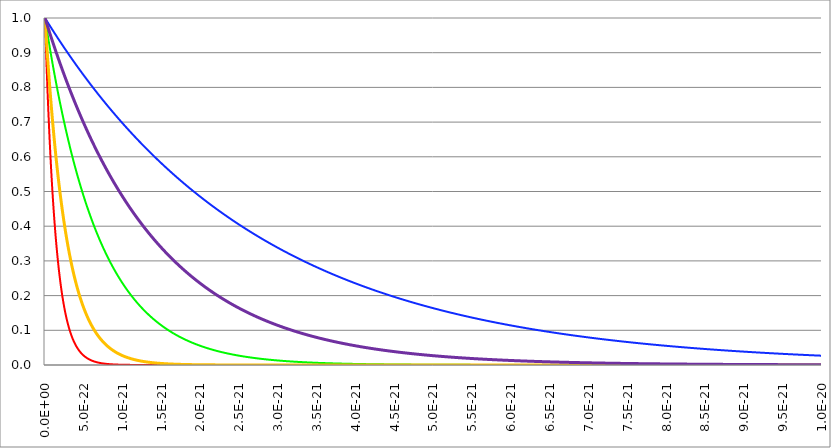
| Category | Series 1 | Series 0 | Series 2 | Series 3 | Series 4 |
|---|---|---|---|---|---|
| 0.0 | 1 | 1 | 1 | 1 | 1 |
| 5e-24 | 0.964 | 0.993 | 0.998 | 0.982 | 0.996 |
| 1e-23 | 0.93 | 0.986 | 0.996 | 0.964 | 0.993 |
| 1.5e-23 | 0.897 | 0.979 | 0.995 | 0.947 | 0.989 |
| 2e-23 | 0.865 | 0.971 | 0.993 | 0.93 | 0.986 |
| 2.5e-23 | 0.834 | 0.964 | 0.991 | 0.913 | 0.982 |
| 3e-23 | 0.805 | 0.957 | 0.989 | 0.897 | 0.979 |
| 3.5e-23 | 0.776 | 0.951 | 0.987 | 0.881 | 0.975 |
| 4e-23 | 0.748 | 0.944 | 0.986 | 0.865 | 0.971 |
| 4.5e-23 | 0.722 | 0.937 | 0.984 | 0.85 | 0.968 |
| 5e-23 | 0.696 | 0.93 | 0.982 | 0.834 | 0.964 |
| 5.5e-23 | 0.671 | 0.923 | 0.98 | 0.819 | 0.961 |
| 6e-23 | 0.648 | 0.917 | 0.979 | 0.805 | 0.957 |
| 6.5e-23 | 0.625 | 0.91 | 0.977 | 0.79 | 0.954 |
| 7e-23 | 0.602 | 0.904 | 0.975 | 0.776 | 0.951 |
| 7.5e-23 | 0.581 | 0.897 | 0.973 | 0.762 | 0.947 |
| 8e-23 | 0.56 | 0.891 | 0.971 | 0.748 | 0.944 |
| 8.5e-23 | 0.54 | 0.884 | 0.97 | 0.735 | 0.94 |
| 9e-23 | 0.521 | 0.878 | 0.968 | 0.722 | 0.937 |
| 9.5e-23 | 0.503 | 0.871 | 0.966 | 0.709 | 0.934 |
| 1e-22 | 0.485 | 0.865 | 0.964 | 0.696 | 0.93 |
| 1.05e-22 | 0.467 | 0.859 | 0.963 | 0.684 | 0.927 |
| 1.1e-22 | 0.451 | 0.853 | 0.961 | 0.671 | 0.923 |
| 1.15e-22 | 0.435 | 0.847 | 0.959 | 0.659 | 0.92 |
| 1.2e-22 | 0.419 | 0.84 | 0.957 | 0.648 | 0.917 |
| 1.25e-22 | 0.404 | 0.834 | 0.956 | 0.636 | 0.913 |
| 1.3e-22 | 0.39 | 0.828 | 0.954 | 0.625 | 0.91 |
| 1.35e-22 | 0.376 | 0.822 | 0.952 | 0.613 | 0.907 |
| 1.4e-22 | 0.363 | 0.816 | 0.951 | 0.602 | 0.904 |
| 1.45e-22 | 0.35 | 0.811 | 0.949 | 0.591 | 0.9 |
| 1.5e-22 | 0.337 | 0.805 | 0.947 | 0.581 | 0.897 |
| 1.55e-22 | 0.325 | 0.799 | 0.945 | 0.57 | 0.894 |
| 1.6e-22 | 0.314 | 0.793 | 0.944 | 0.56 | 0.891 |
| 1.65e-22 | 0.303 | 0.787 | 0.942 | 0.55 | 0.887 |
| 1.7e-22 | 0.292 | 0.782 | 0.94 | 0.54 | 0.884 |
| 1.75e-22 | 0.282 | 0.776 | 0.939 | 0.531 | 0.881 |
| 1.8e-22 | 0.272 | 0.77 | 0.937 | 0.521 | 0.878 |
| 1.85e-22 | 0.262 | 0.765 | 0.935 | 0.512 | 0.875 |
| 1.9e-22 | 0.253 | 0.759 | 0.934 | 0.503 | 0.871 |
| 1.95e-22 | 0.244 | 0.754 | 0.932 | 0.494 | 0.868 |
| 2e-22 | 0.235 | 0.748 | 0.93 | 0.485 | 0.865 |
| 2.05e-22 | 0.227 | 0.743 | 0.928 | 0.476 | 0.862 |
| 2.1e-22 | 0.218 | 0.738 | 0.927 | 0.467 | 0.859 |
| 2.15e-22 | 0.211 | 0.732 | 0.925 | 0.459 | 0.856 |
| 2.2e-22 | 0.203 | 0.727 | 0.923 | 0.451 | 0.853 |
| 2.25e-22 | 0.196 | 0.722 | 0.922 | 0.443 | 0.85 |
| 2.3e-22 | 0.189 | 0.717 | 0.92 | 0.435 | 0.847 |
| 2.35e-22 | 0.182 | 0.711 | 0.918 | 0.427 | 0.843 |
| 2.4e-22 | 0.176 | 0.706 | 0.917 | 0.419 | 0.84 |
| 2.45e-22 | 0.17 | 0.701 | 0.915 | 0.412 | 0.837 |
| 2.5e-22 | 0.164 | 0.696 | 0.913 | 0.404 | 0.834 |
| 2.55e-22 | 0.158 | 0.691 | 0.912 | 0.397 | 0.831 |
| 2.6e-22 | 0.152 | 0.686 | 0.91 | 0.39 | 0.828 |
| 2.65e-22 | 0.147 | 0.681 | 0.908 | 0.383 | 0.825 |
| 2.7e-22 | 0.141 | 0.676 | 0.907 | 0.376 | 0.822 |
| 2.75e-22 | 0.136 | 0.671 | 0.905 | 0.369 | 0.819 |
| 2.8e-22 | 0.132 | 0.667 | 0.904 | 0.363 | 0.816 |
| 2.85e-22 | 0.127 | 0.662 | 0.902 | 0.356 | 0.813 |
| 2.9e-22 | 0.122 | 0.657 | 0.9 | 0.35 | 0.811 |
| 2.95e-22 | 0.118 | 0.652 | 0.899 | 0.344 | 0.808 |
| 3e-22 | 0.114 | 0.648 | 0.897 | 0.337 | 0.805 |
| 3.05e-22 | 0.11 | 0.643 | 0.895 | 0.331 | 0.802 |
| 3.1e-22 | 0.106 | 0.638 | 0.894 | 0.325 | 0.799 |
| 3.15e-22 | 0.102 | 0.634 | 0.892 | 0.32 | 0.796 |
| 3.2e-22 | 0.098 | 0.629 | 0.891 | 0.314 | 0.793 |
| 3.25e-22 | 0.095 | 0.625 | 0.889 | 0.308 | 0.79 |
| 3.3e-22 | 0.092 | 0.62 | 0.887 | 0.303 | 0.787 |
| 3.35e-22 | 0.088 | 0.616 | 0.886 | 0.297 | 0.785 |
| 3.4e-22 | 0.085 | 0.611 | 0.884 | 0.292 | 0.782 |
| 3.45e-22 | 0.082 | 0.607 | 0.883 | 0.287 | 0.779 |
| 3.5e-22 | 0.079 | 0.602 | 0.881 | 0.282 | 0.776 |
| 3.55e-22 | 0.076 | 0.598 | 0.879 | 0.276 | 0.773 |
| 3.6e-22 | 0.074 | 0.594 | 0.878 | 0.272 | 0.77 |
| 3.65e-22 | 0.071 | 0.589 | 0.876 | 0.267 | 0.768 |
| 3.7e-22 | 0.069 | 0.585 | 0.875 | 0.262 | 0.765 |
| 3.75e-22 | 0.066 | 0.581 | 0.873 | 0.257 | 0.762 |
| 3.8e-22 | 0.064 | 0.577 | 0.871 | 0.253 | 0.759 |
| 3.85e-22 | 0.062 | 0.573 | 0.87 | 0.248 | 0.757 |
| 3.9e-22 | 0.059 | 0.568 | 0.868 | 0.244 | 0.754 |
| 3.95e-22 | 0.057 | 0.564 | 0.867 | 0.239 | 0.751 |
| 4e-22 | 0.055 | 0.56 | 0.865 | 0.235 | 0.748 |
| 4.05e-22 | 0.053 | 0.556 | 0.864 | 0.231 | 0.746 |
| 4.1e-22 | 0.051 | 0.552 | 0.862 | 0.227 | 0.743 |
| 4.15e-22 | 0.049 | 0.548 | 0.86 | 0.222 | 0.74 |
| 4.2e-22 | 0.048 | 0.544 | 0.859 | 0.218 | 0.738 |
| 4.25e-22 | 0.046 | 0.54 | 0.857 | 0.215 | 0.735 |
| 4.3e-22 | 0.044 | 0.536 | 0.856 | 0.211 | 0.732 |
| 4.35e-22 | 0.043 | 0.533 | 0.854 | 0.207 | 0.73 |
| 4.4e-22 | 0.041 | 0.529 | 0.853 | 0.203 | 0.727 |
| 4.45e-22 | 0.04 | 0.525 | 0.851 | 0.2 | 0.724 |
| 4.5e-22 | 0.038 | 0.521 | 0.85 | 0.196 | 0.722 |
| 4.55e-22 | 0.037 | 0.517 | 0.848 | 0.192 | 0.719 |
| 4.6e-22 | 0.036 | 0.514 | 0.847 | 0.189 | 0.717 |
| 4.65e-22 | 0.034 | 0.51 | 0.845 | 0.186 | 0.714 |
| 4.7e-22 | 0.033 | 0.506 | 0.843 | 0.182 | 0.711 |
| 4.75e-22 | 0.032 | 0.503 | 0.842 | 0.179 | 0.709 |
| 4.8e-22 | 0.031 | 0.499 | 0.84 | 0.176 | 0.706 |
| 4.85e-22 | 0.03 | 0.495 | 0.839 | 0.173 | 0.704 |
| 4.9e-22 | 0.029 | 0.492 | 0.837 | 0.17 | 0.701 |
| 4.95e-22 | 0.028 | 0.488 | 0.836 | 0.167 | 0.699 |
| 5e-22 | 0.027 | 0.485 | 0.834 | 0.164 | 0.696 |
| 5.05e-22 | 0.026 | 0.481 | 0.833 | 0.161 | 0.694 |
| 5.1e-22 | 0.025 | 0.478 | 0.831 | 0.158 | 0.691 |
| 5.15e-22 | 0.024 | 0.474 | 0.83 | 0.155 | 0.689 |
| 5.2e-22 | 0.023 | 0.471 | 0.828 | 0.152 | 0.686 |
| 5.25e-22 | 0.022 | 0.467 | 0.827 | 0.149 | 0.684 |
| 5.3e-22 | 0.022 | 0.464 | 0.825 | 0.147 | 0.681 |
| 5.35e-22 | 0.021 | 0.461 | 0.824 | 0.144 | 0.679 |
| 5.4e-22 | 0.02 | 0.457 | 0.822 | 0.141 | 0.676 |
| 5.45000000000001e-22 | 0.019 | 0.454 | 0.821 | 0.139 | 0.674 |
| 5.50000000000001e-22 | 0.019 | 0.451 | 0.819 | 0.136 | 0.671 |
| 5.55000000000001e-22 | 0.018 | 0.448 | 0.818 | 0.134 | 0.669 |
| 5.60000000000001e-22 | 0.017 | 0.444 | 0.816 | 0.132 | 0.667 |
| 5.65000000000001e-22 | 0.017 | 0.441 | 0.815 | 0.129 | 0.664 |
| 5.70000000000001e-22 | 0.016 | 0.438 | 0.813 | 0.127 | 0.662 |
| 5.75000000000001e-22 | 0.016 | 0.435 | 0.812 | 0.125 | 0.659 |
| 5.80000000000001e-22 | 0.015 | 0.432 | 0.811 | 0.122 | 0.657 |
| 5.85000000000001e-22 | 0.014 | 0.429 | 0.809 | 0.12 | 0.655 |
| 5.90000000000001e-22 | 0.014 | 0.425 | 0.808 | 0.118 | 0.652 |
| 5.95000000000001e-22 | 0.013 | 0.422 | 0.806 | 0.116 | 0.65 |
| 6.00000000000001e-22 | 0.013 | 0.419 | 0.805 | 0.114 | 0.648 |
| 6.05000000000001e-22 | 0.013 | 0.416 | 0.803 | 0.112 | 0.645 |
| 6.10000000000001e-22 | 0.012 | 0.413 | 0.802 | 0.11 | 0.643 |
| 6.15000000000001e-22 | 0.012 | 0.41 | 0.8 | 0.108 | 0.641 |
| 6.20000000000001e-22 | 0.011 | 0.407 | 0.799 | 0.106 | 0.638 |
| 6.25000000000001e-22 | 0.011 | 0.404 | 0.797 | 0.104 | 0.636 |
| 6.30000000000001e-22 | 0.01 | 0.401 | 0.796 | 0.102 | 0.634 |
| 6.35000000000001e-22 | 0.01 | 0.399 | 0.795 | 0.1 | 0.631 |
| 6.40000000000001e-22 | 0.01 | 0.396 | 0.793 | 0.098 | 0.629 |
| 6.45000000000001e-22 | 0.009 | 0.393 | 0.792 | 0.097 | 0.627 |
| 6.50000000000001e-22 | 0.009 | 0.39 | 0.79 | 0.095 | 0.625 |
| 6.55000000000001e-22 | 0.009 | 0.387 | 0.789 | 0.093 | 0.622 |
| 6.60000000000001e-22 | 0.008 | 0.384 | 0.787 | 0.092 | 0.62 |
| 6.65000000000001e-22 | 0.008 | 0.382 | 0.786 | 0.09 | 0.618 |
| 6.70000000000001e-22 | 0.008 | 0.379 | 0.785 | 0.088 | 0.616 |
| 6.75000000000001e-22 | 0.008 | 0.376 | 0.783 | 0.087 | 0.613 |
| 6.80000000000001e-22 | 0.007 | 0.373 | 0.782 | 0.085 | 0.611 |
| 6.85000000000001e-22 | 0.007 | 0.371 | 0.78 | 0.084 | 0.609 |
| 6.90000000000002e-22 | 0.007 | 0.368 | 0.779 | 0.082 | 0.607 |
| 6.95000000000002e-22 | 0.007 | 0.365 | 0.777 | 0.081 | 0.604 |
| 7.00000000000002e-22 | 0.006 | 0.363 | 0.776 | 0.079 | 0.602 |
| 7.05000000000002e-22 | 0.006 | 0.36 | 0.775 | 0.078 | 0.6 |
| 7.10000000000002e-22 | 0.006 | 0.358 | 0.773 | 0.076 | 0.598 |
| 7.15000000000002e-22 | 0.006 | 0.355 | 0.772 | 0.075 | 0.596 |
| 7.20000000000002e-22 | 0.005 | 0.352 | 0.77 | 0.074 | 0.594 |
| 7.25000000000002e-22 | 0.005 | 0.35 | 0.769 | 0.072 | 0.591 |
| 7.30000000000002e-22 | 0.005 | 0.347 | 0.768 | 0.071 | 0.589 |
| 7.35000000000002e-22 | 0.005 | 0.345 | 0.766 | 0.07 | 0.587 |
| 7.40000000000002e-22 | 0.005 | 0.342 | 0.765 | 0.069 | 0.585 |
| 7.45000000000002e-22 | 0.005 | 0.34 | 0.764 | 0.067 | 0.583 |
| 7.50000000000002e-22 | 0.004 | 0.337 | 0.762 | 0.066 | 0.581 |
| 7.55000000000002e-22 | 0.004 | 0.335 | 0.761 | 0.065 | 0.579 |
| 7.60000000000002e-22 | 0.004 | 0.333 | 0.759 | 0.064 | 0.577 |
| 7.65000000000002e-22 | 0.004 | 0.33 | 0.758 | 0.063 | 0.575 |
| 7.70000000000002e-22 | 0.004 | 0.328 | 0.757 | 0.062 | 0.573 |
| 7.75000000000002e-22 | 0.004 | 0.325 | 0.755 | 0.06 | 0.57 |
| 7.80000000000002e-22 | 0.004 | 0.323 | 0.754 | 0.059 | 0.568 |
| 7.85000000000002e-22 | 0.003 | 0.321 | 0.753 | 0.058 | 0.566 |
| 7.90000000000002e-22 | 0.003 | 0.318 | 0.751 | 0.057 | 0.564 |
| 7.95000000000002e-22 | 0.003 | 0.316 | 0.75 | 0.056 | 0.562 |
| 8.00000000000002e-22 | 0.003 | 0.314 | 0.748 | 0.055 | 0.56 |
| 8.05000000000002e-22 | 0.003 | 0.312 | 0.747 | 0.054 | 0.558 |
| 8.10000000000002e-22 | 0.003 | 0.309 | 0.746 | 0.053 | 0.556 |
| 8.15000000000002e-22 | 0.003 | 0.307 | 0.744 | 0.052 | 0.554 |
| 8.20000000000002e-22 | 0.003 | 0.305 | 0.743 | 0.051 | 0.552 |
| 8.25000000000002e-22 | 0.003 | 0.303 | 0.742 | 0.05 | 0.55 |
| 8.30000000000002e-22 | 0.002 | 0.3 | 0.74 | 0.049 | 0.548 |
| 8.35000000000002e-22 | 0.002 | 0.298 | 0.739 | 0.049 | 0.546 |
| 8.40000000000003e-22 | 0.002 | 0.296 | 0.738 | 0.048 | 0.544 |
| 8.45000000000003e-22 | 0.002 | 0.294 | 0.736 | 0.047 | 0.542 |
| 8.50000000000003e-22 | 0.002 | 0.292 | 0.735 | 0.046 | 0.54 |
| 8.55000000000003e-22 | 0.002 | 0.29 | 0.734 | 0.045 | 0.538 |
| 8.60000000000002e-22 | 0.002 | 0.288 | 0.732 | 0.044 | 0.536 |
| 8.65000000000002e-22 | 0.002 | 0.286 | 0.731 | 0.044 | 0.534 |
| 8.70000000000002e-22 | 0.002 | 0.284 | 0.73 | 0.043 | 0.533 |
| 8.75000000000002e-22 | 0.002 | 0.282 | 0.728 | 0.042 | 0.531 |
| 8.80000000000002e-22 | 0.002 | 0.279 | 0.727 | 0.041 | 0.529 |
| 8.85000000000002e-22 | 0.002 | 0.277 | 0.726 | 0.041 | 0.527 |
| 8.90000000000002e-22 | 0.002 | 0.275 | 0.724 | 0.04 | 0.525 |
| 8.95000000000002e-22 | 0.002 | 0.273 | 0.723 | 0.039 | 0.523 |
| 9.00000000000002e-22 | 0.001 | 0.272 | 0.722 | 0.038 | 0.521 |
| 9.05000000000002e-22 | 0.001 | 0.27 | 0.721 | 0.038 | 0.519 |
| 9.10000000000002e-22 | 0.001 | 0.268 | 0.719 | 0.037 | 0.517 |
| 9.15000000000002e-22 | 0.001 | 0.266 | 0.718 | 0.036 | 0.515 |
| 9.20000000000002e-22 | 0.001 | 0.264 | 0.717 | 0.036 | 0.514 |
| 9.25000000000002e-22 | 0.001 | 0.262 | 0.715 | 0.035 | 0.512 |
| 9.30000000000002e-22 | 0.001 | 0.26 | 0.714 | 0.034 | 0.51 |
| 9.35000000000002e-22 | 0.001 | 0.258 | 0.713 | 0.034 | 0.508 |
| 9.40000000000001e-22 | 0.001 | 0.256 | 0.711 | 0.033 | 0.506 |
| 9.45000000000002e-22 | 0.001 | 0.254 | 0.71 | 0.033 | 0.504 |
| 9.50000000000001e-22 | 0.001 | 0.253 | 0.709 | 0.032 | 0.503 |
| 9.55000000000001e-22 | 0.001 | 0.251 | 0.708 | 0.031 | 0.501 |
| 9.60000000000001e-22 | 0.001 | 0.249 | 0.706 | 0.031 | 0.499 |
| 9.65000000000001e-22 | 0.001 | 0.247 | 0.705 | 0.03 | 0.497 |
| 9.70000000000001e-22 | 0.001 | 0.245 | 0.704 | 0.03 | 0.495 |
| 9.75000000000001e-22 | 0.001 | 0.244 | 0.703 | 0.029 | 0.494 |
| 9.80000000000001e-22 | 0.001 | 0.242 | 0.701 | 0.029 | 0.492 |
| 9.85000000000001e-22 | 0.001 | 0.24 | 0.7 | 0.028 | 0.49 |
| 9.90000000000001e-22 | 0.001 | 0.238 | 0.699 | 0.028 | 0.488 |
| 9.95000000000001e-22 | 0.001 | 0.237 | 0.697 | 0.027 | 0.486 |
| 1e-21 | 0.001 | 0.235 | 0.696 | 0.027 | 0.485 |
| 1.005e-21 | 0.001 | 0.233 | 0.695 | 0.026 | 0.483 |
| 1.01e-21 | 0.001 | 0.232 | 0.694 | 0.026 | 0.481 |
| 1.015e-21 | 0.001 | 0.23 | 0.692 | 0.025 | 0.479 |
| 1.02e-21 | 0.001 | 0.228 | 0.691 | 0.025 | 0.478 |
| 1.025e-21 | 0.001 | 0.227 | 0.69 | 0.024 | 0.476 |
| 1.03e-21 | 0.001 | 0.225 | 0.689 | 0.024 | 0.474 |
| 1.035e-21 | 0.001 | 0.223 | 0.687 | 0.024 | 0.473 |
| 1.04e-21 | 0.001 | 0.222 | 0.686 | 0.023 | 0.471 |
| 1.045e-21 | 0.001 | 0.22 | 0.685 | 0.023 | 0.469 |
| 1.05e-21 | 0 | 0.218 | 0.684 | 0.022 | 0.467 |
| 1.055e-21 | 0 | 0.217 | 0.682 | 0.022 | 0.466 |
| 1.06e-21 | 0 | 0.215 | 0.681 | 0.022 | 0.464 |
| 1.065e-21 | 0 | 0.214 | 0.68 | 0.021 | 0.462 |
| 1.07e-21 | 0 | 0.212 | 0.679 | 0.021 | 0.461 |
| 1.075e-21 | 0 | 0.211 | 0.678 | 0.02 | 0.459 |
| 1.08e-21 | 0 | 0.209 | 0.676 | 0.02 | 0.457 |
| 1.085e-21 | 0 | 0.208 | 0.675 | 0.02 | 0.456 |
| 1.09e-21 | 0 | 0.206 | 0.674 | 0.019 | 0.454 |
| 1.095e-21 | 0 | 0.205 | 0.673 | 0.019 | 0.452 |
| 1.1e-21 | 0 | 0.203 | 0.671 | 0.019 | 0.451 |
| 1.105e-21 | 0 | 0.202 | 0.67 | 0.018 | 0.449 |
| 1.11e-21 | 0 | 0.2 | 0.669 | 0.018 | 0.448 |
| 1.115e-21 | 0 | 0.199 | 0.668 | 0.018 | 0.446 |
| 1.12e-21 | 0 | 0.197 | 0.667 | 0.017 | 0.444 |
| 1.125e-21 | 0 | 0.196 | 0.665 | 0.017 | 0.443 |
| 1.13e-21 | 0 | 0.195 | 0.664 | 0.017 | 0.441 |
| 1.135e-21 | 0 | 0.193 | 0.663 | 0.016 | 0.44 |
| 1.14e-21 | 0 | 0.192 | 0.662 | 0.016 | 0.438 |
| 1.145e-21 | 0 | 0.19 | 0.661 | 0.016 | 0.436 |
| 1.15e-21 | 0 | 0.189 | 0.659 | 0.016 | 0.435 |
| 1.155e-21 | 0 | 0.188 | 0.658 | 0.015 | 0.433 |
| 1.16e-21 | 0 | 0.186 | 0.657 | 0.015 | 0.432 |
| 1.165e-21 | 0 | 0.185 | 0.656 | 0.015 | 0.43 |
| 1.17e-21 | 0 | 0.184 | 0.655 | 0.014 | 0.429 |
| 1.175e-21 | 0 | 0.182 | 0.653 | 0.014 | 0.427 |
| 1.18e-21 | 0 | 0.181 | 0.652 | 0.014 | 0.425 |
| 1.185e-21 | 0 | 0.18 | 0.651 | 0.014 | 0.424 |
| 1.19e-21 | 0 | 0.178 | 0.65 | 0.013 | 0.422 |
| 1.195e-21 | 0 | 0.177 | 0.649 | 0.013 | 0.421 |
| 1.2e-21 | 0 | 0.176 | 0.648 | 0.013 | 0.419 |
| 1.205e-21 | 0 | 0.175 | 0.646 | 0.013 | 0.418 |
| 1.21e-21 | 0 | 0.173 | 0.645 | 0.013 | 0.416 |
| 1.215e-21 | 0 | 0.172 | 0.644 | 0.012 | 0.415 |
| 1.22e-21 | 0 | 0.171 | 0.643 | 0.012 | 0.413 |
| 1.225e-21 | 0 | 0.17 | 0.642 | 0.012 | 0.412 |
| 1.23e-21 | 0 | 0.168 | 0.641 | 0.012 | 0.41 |
| 1.235e-21 | 0 | 0.167 | 0.639 | 0.011 | 0.409 |
| 1.24e-21 | 0 | 0.166 | 0.638 | 0.011 | 0.407 |
| 1.245e-21 | 0 | 0.165 | 0.637 | 0.011 | 0.406 |
| 1.25e-21 | 0 | 0.164 | 0.636 | 0.011 | 0.404 |
| 1.255e-21 | 0 | 0.162 | 0.635 | 0.011 | 0.403 |
| 1.26e-21 | 0 | 0.161 | 0.634 | 0.01 | 0.401 |
| 1.265e-21 | 0 | 0.16 | 0.632 | 0.01 | 0.4 |
| 1.27e-21 | 0 | 0.159 | 0.631 | 0.01 | 0.399 |
| 1.275e-21 | 0 | 0.158 | 0.63 | 0.01 | 0.397 |
| 1.28e-21 | 0 | 0.157 | 0.629 | 0.01 | 0.396 |
| 1.285e-21 | 0 | 0.155 | 0.628 | 0.01 | 0.394 |
| 1.29e-21 | 0 | 0.154 | 0.627 | 0.009 | 0.393 |
| 1.295e-21 | 0 | 0.153 | 0.626 | 0.009 | 0.391 |
| 1.3e-21 | 0 | 0.152 | 0.625 | 0.009 | 0.39 |
| 1.305e-21 | 0 | 0.151 | 0.623 | 0.009 | 0.389 |
| 1.31e-21 | 0 | 0.15 | 0.622 | 0.009 | 0.387 |
| 1.315e-21 | 0 | 0.149 | 0.621 | 0.009 | 0.386 |
| 1.32e-21 | 0 | 0.148 | 0.62 | 0.008 | 0.384 |
| 1.325e-21 | 0 | 0.147 | 0.619 | 0.008 | 0.383 |
| 1.33e-21 | 0 | 0.146 | 0.618 | 0.008 | 0.382 |
| 1.335e-21 | 0 | 0.145 | 0.617 | 0.008 | 0.38 |
| 1.34e-21 | 0 | 0.144 | 0.616 | 0.008 | 0.379 |
| 1.345e-21 | 0 | 0.143 | 0.614 | 0.008 | 0.378 |
| 1.35e-21 | 0 | 0.141 | 0.613 | 0.008 | 0.376 |
| 1.355e-21 | 0 | 0.14 | 0.612 | 0.007 | 0.375 |
| 1.36e-21 | 0 | 0.139 | 0.611 | 0.007 | 0.373 |
| 1.365e-21 | 0 | 0.138 | 0.61 | 0.007 | 0.372 |
| 1.37e-21 | 0 | 0.137 | 0.609 | 0.007 | 0.371 |
| 1.375e-21 | 0 | 0.136 | 0.608 | 0.007 | 0.369 |
| 1.38e-21 | 0 | 0.135 | 0.607 | 0.007 | 0.368 |
| 1.385e-21 | 0 | 0.134 | 0.606 | 0.007 | 0.367 |
| 1.39e-21 | 0 | 0.134 | 0.604 | 0.007 | 0.365 |
| 1.395e-21 | 0 | 0.133 | 0.603 | 0.006 | 0.364 |
| 1.4e-21 | 0 | 0.132 | 0.602 | 0.006 | 0.363 |
| 1.405e-21 | 0 | 0.131 | 0.601 | 0.006 | 0.361 |
| 1.41e-21 | 0 | 0.13 | 0.6 | 0.006 | 0.36 |
| 1.415e-21 | 0 | 0.129 | 0.599 | 0.006 | 0.359 |
| 1.42e-21 | 0 | 0.128 | 0.598 | 0.006 | 0.358 |
| 1.425e-21 | 0 | 0.127 | 0.597 | 0.006 | 0.356 |
| 1.43e-21 | 0 | 0.126 | 0.596 | 0.006 | 0.355 |
| 1.435e-21 | 0 | 0.125 | 0.595 | 0.006 | 0.354 |
| 1.44e-21 | 0 | 0.124 | 0.594 | 0.005 | 0.352 |
| 1.445e-21 | 0 | 0.123 | 0.593 | 0.005 | 0.351 |
| 1.45e-21 | 0 | 0.122 | 0.591 | 0.005 | 0.35 |
| 1.455e-21 | 0 | 0.122 | 0.59 | 0.005 | 0.349 |
| 1.46e-21 | 0 | 0.121 | 0.589 | 0.005 | 0.347 |
| 1.465e-21 | 0 | 0.12 | 0.588 | 0.005 | 0.346 |
| 1.47e-21 | 0 | 0.119 | 0.587 | 0.005 | 0.345 |
| 1.47499999999999e-21 | 0 | 0.118 | 0.586 | 0.005 | 0.344 |
| 1.47999999999999e-21 | 0 | 0.117 | 0.585 | 0.005 | 0.342 |
| 1.48499999999999e-21 | 0 | 0.116 | 0.584 | 0.005 | 0.341 |
| 1.48999999999999e-21 | 0 | 0.116 | 0.583 | 0.005 | 0.34 |
| 1.49499999999999e-21 | 0 | 0.115 | 0.582 | 0.004 | 0.339 |
| 1.49999999999999e-21 | 0 | 0.114 | 0.581 | 0.004 | 0.337 |
| 1.50499999999999e-21 | 0 | 0.113 | 0.58 | 0.004 | 0.336 |
| 1.50999999999999e-21 | 0 | 0.112 | 0.579 | 0.004 | 0.335 |
| 1.51499999999999e-21 | 0 | 0.111 | 0.578 | 0.004 | 0.334 |
| 1.51999999999999e-21 | 0 | 0.111 | 0.577 | 0.004 | 0.333 |
| 1.52499999999999e-21 | 0 | 0.11 | 0.576 | 0.004 | 0.331 |
| 1.52999999999999e-21 | 0 | 0.109 | 0.575 | 0.004 | 0.33 |
| 1.53499999999999e-21 | 0 | 0.108 | 0.574 | 0.004 | 0.329 |
| 1.53999999999999e-21 | 0 | 0.107 | 0.573 | 0.004 | 0.328 |
| 1.54499999999999e-21 | 0 | 0.107 | 0.571 | 0.004 | 0.327 |
| 1.54999999999999e-21 | 0 | 0.106 | 0.57 | 0.004 | 0.325 |
| 1.55499999999999e-21 | 0 | 0.105 | 0.569 | 0.004 | 0.324 |
| 1.55999999999999e-21 | 0 | 0.104 | 0.568 | 0.004 | 0.323 |
| 1.56499999999999e-21 | 0 | 0.104 | 0.567 | 0.003 | 0.322 |
| 1.56999999999999e-21 | 0 | 0.103 | 0.566 | 0.003 | 0.321 |
| 1.57499999999999e-21 | 0 | 0.102 | 0.565 | 0.003 | 0.32 |
| 1.57999999999999e-21 | 0 | 0.101 | 0.564 | 0.003 | 0.318 |
| 1.58499999999999e-21 | 0 | 0.101 | 0.563 | 0.003 | 0.317 |
| 1.58999999999999e-21 | 0 | 0.1 | 0.562 | 0.003 | 0.316 |
| 1.59499999999999e-21 | 0 | 0.099 | 0.561 | 0.003 | 0.315 |
| 1.59999999999999e-21 | 0 | 0.098 | 0.56 | 0.003 | 0.314 |
| 1.60499999999999e-21 | 0 | 0.098 | 0.559 | 0.003 | 0.313 |
| 1.60999999999999e-21 | 0 | 0.097 | 0.558 | 0.003 | 0.312 |
| 1.61499999999999e-21 | 0 | 0.096 | 0.557 | 0.003 | 0.31 |
| 1.61999999999999e-21 | 0 | 0.096 | 0.556 | 0.003 | 0.309 |
| 1.62499999999999e-21 | 0 | 0.095 | 0.555 | 0.003 | 0.308 |
| 1.62999999999999e-21 | 0 | 0.094 | 0.554 | 0.003 | 0.307 |
| 1.63499999999999e-21 | 0 | 0.094 | 0.553 | 0.003 | 0.306 |
| 1.63999999999999e-21 | 0 | 0.093 | 0.552 | 0.003 | 0.305 |
| 1.64499999999999e-21 | 0 | 0.092 | 0.551 | 0.003 | 0.304 |
| 1.64999999999999e-21 | 0 | 0.092 | 0.55 | 0.003 | 0.303 |
| 1.65499999999999e-21 | 0 | 0.091 | 0.549 | 0.002 | 0.302 |
| 1.65999999999999e-21 | 0 | 0.09 | 0.548 | 0.002 | 0.3 |
| 1.66499999999999e-21 | 0 | 0.09 | 0.547 | 0.002 | 0.299 |
| 1.66999999999999e-21 | 0 | 0.089 | 0.546 | 0.002 | 0.298 |
| 1.67499999999999e-21 | 0 | 0.088 | 0.545 | 0.002 | 0.297 |
| 1.67999999999999e-21 | 0 | 0.088 | 0.544 | 0.002 | 0.296 |
| 1.68499999999999e-21 | 0 | 0.087 | 0.543 | 0.002 | 0.295 |
| 1.68999999999999e-21 | 0 | 0.086 | 0.542 | 0.002 | 0.294 |
| 1.69499999999999e-21 | 0 | 0.086 | 0.541 | 0.002 | 0.293 |
| 1.69999999999999e-21 | 0 | 0.085 | 0.54 | 0.002 | 0.292 |
| 1.70499999999999e-21 | 0 | 0.085 | 0.539 | 0.002 | 0.291 |
| 1.70999999999999e-21 | 0 | 0.084 | 0.538 | 0.002 | 0.29 |
| 1.71499999999999e-21 | 0 | 0.083 | 0.537 | 0.002 | 0.289 |
| 1.71999999999999e-21 | 0 | 0.083 | 0.536 | 0.002 | 0.288 |
| 1.72499999999999e-21 | 0 | 0.082 | 0.535 | 0.002 | 0.287 |
| 1.72999999999999e-21 | 0 | 0.082 | 0.534 | 0.002 | 0.286 |
| 1.73499999999999e-21 | 0 | 0.081 | 0.533 | 0.002 | 0.285 |
| 1.73999999999999e-21 | 0 | 0.08 | 0.533 | 0.002 | 0.284 |
| 1.74499999999999e-21 | 0 | 0.08 | 0.532 | 0.002 | 0.283 |
| 1.74999999999999e-21 | 0 | 0.079 | 0.531 | 0.002 | 0.282 |
| 1.75499999999999e-21 | 0 | 0.079 | 0.53 | 0.002 | 0.281 |
| 1.75999999999999e-21 | 0 | 0.078 | 0.529 | 0.002 | 0.279 |
| 1.76499999999999e-21 | 0 | 0.078 | 0.528 | 0.002 | 0.278 |
| 1.76999999999999e-21 | 0 | 0.077 | 0.527 | 0.002 | 0.277 |
| 1.77499999999999e-21 | 0 | 0.076 | 0.526 | 0.002 | 0.276 |
| 1.77999999999999e-21 | 0 | 0.076 | 0.525 | 0.002 | 0.275 |
| 1.78499999999999e-21 | 0 | 0.075 | 0.524 | 0.002 | 0.274 |
| 1.78999999999999e-21 | 0 | 0.075 | 0.523 | 0.002 | 0.273 |
| 1.79499999999999e-21 | 0 | 0.074 | 0.522 | 0.002 | 0.273 |
| 1.79999999999999e-21 | 0 | 0.074 | 0.521 | 0.001 | 0.272 |
| 1.80499999999999e-21 | 0 | 0.073 | 0.52 | 0.001 | 0.271 |
| 1.80999999999999e-21 | 0 | 0.073 | 0.519 | 0.001 | 0.27 |
| 1.81499999999999e-21 | 0 | 0.072 | 0.518 | 0.001 | 0.269 |
| 1.81999999999999e-21 | 0 | 0.072 | 0.517 | 0.001 | 0.268 |
| 1.82499999999999e-21 | 0 | 0.071 | 0.516 | 0.001 | 0.267 |
| 1.82999999999999e-21 | 0 | 0.071 | 0.515 | 0.001 | 0.266 |
| 1.83499999999999e-21 | 0 | 0.07 | 0.515 | 0.001 | 0.265 |
| 1.83999999999999e-21 | 0 | 0.07 | 0.514 | 0.001 | 0.264 |
| 1.84499999999999e-21 | 0 | 0.069 | 0.513 | 0.001 | 0.263 |
| 1.84999999999999e-21 | 0 | 0.069 | 0.512 | 0.001 | 0.262 |
| 1.85499999999999e-21 | 0 | 0.068 | 0.511 | 0.001 | 0.261 |
| 1.85999999999999e-21 | 0 | 0.068 | 0.51 | 0.001 | 0.26 |
| 1.86499999999999e-21 | 0 | 0.067 | 0.509 | 0.001 | 0.259 |
| 1.86999999999999e-21 | 0 | 0.067 | 0.508 | 0.001 | 0.258 |
| 1.87499999999999e-21 | 0 | 0.066 | 0.507 | 0.001 | 0.257 |
| 1.87999999999999e-21 | 0 | 0.066 | 0.506 | 0.001 | 0.256 |
| 1.88499999999999e-21 | 0 | 0.065 | 0.505 | 0.001 | 0.255 |
| 1.88999999999999e-21 | 0 | 0.065 | 0.504 | 0.001 | 0.254 |
| 1.89499999999999e-21 | 0 | 0.064 | 0.503 | 0.001 | 0.253 |
| 1.89999999999999e-21 | 0 | 0.064 | 0.503 | 0.001 | 0.253 |
| 1.90499999999999e-21 | 0 | 0.063 | 0.502 | 0.001 | 0.252 |
| 1.90999999999999e-21 | 0 | 0.063 | 0.501 | 0.001 | 0.251 |
| 1.91499999999999e-21 | 0 | 0.062 | 0.5 | 0.001 | 0.25 |
| 1.91999999999999e-21 | 0 | 0.062 | 0.499 | 0.001 | 0.249 |
| 1.92499999999999e-21 | 0 | 0.062 | 0.498 | 0.001 | 0.248 |
| 1.92999999999999e-21 | 0 | 0.061 | 0.497 | 0.001 | 0.247 |
| 1.93499999999999e-21 | 0 | 0.061 | 0.496 | 0.001 | 0.246 |
| 1.93999999999999e-21 | 0 | 0.06 | 0.495 | 0.001 | 0.245 |
| 1.94499999999999e-21 | 0 | 0.06 | 0.494 | 0.001 | 0.244 |
| 1.94999999999999e-21 | 0 | 0.059 | 0.494 | 0.001 | 0.244 |
| 1.95499999999999e-21 | 0 | 0.059 | 0.493 | 0.001 | 0.243 |
| 1.95999999999999e-21 | 0 | 0.058 | 0.492 | 0.001 | 0.242 |
| 1.96499999999999e-21 | 0 | 0.058 | 0.491 | 0.001 | 0.241 |
| 1.96999999999999e-21 | 0 | 0.058 | 0.49 | 0.001 | 0.24 |
| 1.97499999999999e-21 | 0 | 0.057 | 0.489 | 0.001 | 0.239 |
| 1.97999999999999e-21 | 0 | 0.057 | 0.488 | 0.001 | 0.238 |
| 1.98499999999999e-21 | 0 | 0.056 | 0.487 | 0.001 | 0.237 |
| 1.98999999999999e-21 | 0 | 0.056 | 0.486 | 0.001 | 0.237 |
| 1.99499999999999e-21 | 0 | 0.056 | 0.486 | 0.001 | 0.236 |
| 1.99999999999999e-21 | 0 | 0.055 | 0.485 | 0.001 | 0.235 |
| 2.00499999999999e-21 | 0 | 0.055 | 0.484 | 0.001 | 0.234 |
| 2.00999999999999e-21 | 0 | 0.054 | 0.483 | 0.001 | 0.233 |
| 2.01499999999999e-21 | 0 | 0.054 | 0.482 | 0.001 | 0.232 |
| 2.01999999999999e-21 | 0 | 0.054 | 0.481 | 0.001 | 0.232 |
| 2.02499999999999e-21 | 0 | 0.053 | 0.48 | 0.001 | 0.231 |
| 2.02999999999999e-21 | 0 | 0.053 | 0.479 | 0.001 | 0.23 |
| 2.03499999999999e-21 | 0 | 0.052 | 0.479 | 0.001 | 0.229 |
| 2.03999999999999e-21 | 0 | 0.052 | 0.478 | 0.001 | 0.228 |
| 2.04499999999999e-21 | 0 | 0.052 | 0.477 | 0.001 | 0.227 |
| 2.04999999999999e-21 | 0 | 0.051 | 0.476 | 0.001 | 0.227 |
| 2.05499999999999e-21 | 0 | 0.051 | 0.475 | 0.001 | 0.226 |
| 2.05999999999999e-21 | 0 | 0.051 | 0.474 | 0.001 | 0.225 |
| 2.06499999999999e-21 | 0 | 0.05 | 0.473 | 0.001 | 0.224 |
| 2.06999999999999e-21 | 0 | 0.05 | 0.473 | 0.001 | 0.223 |
| 2.07499999999999e-21 | 0 | 0.049 | 0.472 | 0.001 | 0.222 |
| 2.07999999999999e-21 | 0 | 0.049 | 0.471 | 0.001 | 0.222 |
| 2.08499999999999e-21 | 0 | 0.049 | 0.47 | 0.001 | 0.221 |
| 2.08999999999999e-21 | 0 | 0.048 | 0.469 | 0.001 | 0.22 |
| 2.09499999999999e-21 | 0 | 0.048 | 0.468 | 0.001 | 0.219 |
| 2.09999999999999e-21 | 0 | 0.048 | 0.467 | 0 | 0.218 |
| 2.10499999999999e-21 | 0 | 0.047 | 0.467 | 0 | 0.218 |
| 2.10999999999999e-21 | 0 | 0.047 | 0.466 | 0 | 0.217 |
| 2.11499999999999e-21 | 0 | 0.047 | 0.465 | 0 | 0.216 |
| 2.11999999999999e-21 | 0 | 0.046 | 0.464 | 0 | 0.215 |
| 2.12499999999999e-21 | 0 | 0.046 | 0.463 | 0 | 0.215 |
| 2.12999999999999e-21 | 0 | 0.046 | 0.462 | 0 | 0.214 |
| 2.13499999999999e-21 | 0 | 0.045 | 0.462 | 0 | 0.213 |
| 2.13999999999999e-21 | 0 | 0.045 | 0.461 | 0 | 0.212 |
| 2.14499999999999e-21 | 0 | 0.045 | 0.46 | 0 | 0.211 |
| 2.14999999999999e-21 | 0 | 0.044 | 0.459 | 0 | 0.211 |
| 2.15499999999999e-21 | 0 | 0.044 | 0.458 | 0 | 0.21 |
| 2.15999999999999e-21 | 0 | 0.044 | 0.457 | 0 | 0.209 |
| 2.16499999999999e-21 | 0 | 0.043 | 0.457 | 0 | 0.208 |
| 2.16999999999999e-21 | 0 | 0.043 | 0.456 | 0 | 0.208 |
| 2.17499999999999e-21 | 0 | 0.043 | 0.455 | 0 | 0.207 |
| 2.17999999999999e-21 | 0 | 0.043 | 0.454 | 0 | 0.206 |
| 2.18499999999999e-21 | 0 | 0.042 | 0.453 | 0 | 0.205 |
| 2.18999999999999e-21 | 0 | 0.042 | 0.452 | 0 | 0.205 |
| 2.19499999999999e-21 | 0 | 0.042 | 0.452 | 0 | 0.204 |
| 2.19999999999999e-21 | 0 | 0.041 | 0.451 | 0 | 0.203 |
| 2.20499999999999e-21 | 0 | 0.041 | 0.45 | 0 | 0.202 |
| 2.20999999999999e-21 | 0 | 0.041 | 0.449 | 0 | 0.202 |
| 2.21499999999999e-21 | 0 | 0.04 | 0.448 | 0 | 0.201 |
| 2.21999999999999e-21 | 0 | 0.04 | 0.448 | 0 | 0.2 |
| 2.22499999999999e-21 | 0 | 0.04 | 0.447 | 0 | 0.2 |
| 2.22999999999999e-21 | 0 | 0.04 | 0.446 | 0 | 0.199 |
| 2.23499999999999e-21 | 0 | 0.039 | 0.445 | 0 | 0.198 |
| 2.23999999999999e-21 | 0 | 0.039 | 0.444 | 0 | 0.197 |
| 2.24499999999999e-21 | 0 | 0.039 | 0.444 | 0 | 0.197 |
| 2.24999999999999e-21 | 0 | 0.038 | 0.443 | 0 | 0.196 |
| 2.25499999999999e-21 | 0 | 0.038 | 0.442 | 0 | 0.195 |
| 2.25999999999999e-21 | 0 | 0.038 | 0.441 | 0 | 0.195 |
| 2.26499999999999e-21 | 0 | 0.038 | 0.44 | 0 | 0.194 |
| 2.26999999999999e-21 | 0 | 0.037 | 0.44 | 0 | 0.193 |
| 2.27499999999999e-21 | 0 | 0.037 | 0.439 | 0 | 0.192 |
| 2.27999999999999e-21 | 0 | 0.037 | 0.438 | 0 | 0.192 |
| 2.28499999999999e-21 | 0 | 0.037 | 0.437 | 0 | 0.191 |
| 2.28999999999999e-21 | 0 | 0.036 | 0.436 | 0 | 0.19 |
| 2.29499999999999e-21 | 0 | 0.036 | 0.436 | 0 | 0.19 |
| 2.29999999999999e-21 | 0 | 0.036 | 0.435 | 0 | 0.189 |
| 2.30499999999999e-21 | 0 | 0.035 | 0.434 | 0 | 0.188 |
| 2.30999999999998e-21 | 0 | 0.035 | 0.433 | 0 | 0.188 |
| 2.31499999999998e-21 | 0 | 0.035 | 0.432 | 0 | 0.187 |
| 2.31999999999998e-21 | 0 | 0.035 | 0.432 | 0 | 0.186 |
| 2.32499999999998e-21 | 0 | 0.034 | 0.431 | 0 | 0.186 |
| 2.32999999999998e-21 | 0 | 0.034 | 0.43 | 0 | 0.185 |
| 2.33499999999998e-21 | 0 | 0.034 | 0.429 | 0 | 0.184 |
| 2.33999999999998e-21 | 0 | 0.034 | 0.429 | 0 | 0.184 |
| 2.34499999999998e-21 | 0 | 0.033 | 0.428 | 0 | 0.183 |
| 2.34999999999998e-21 | 0 | 0.033 | 0.427 | 0 | 0.182 |
| 2.35499999999998e-21 | 0 | 0.033 | 0.426 | 0 | 0.182 |
| 2.35999999999998e-21 | 0 | 0.033 | 0.425 | 0 | 0.181 |
| 2.36499999999998e-21 | 0 | 0.033 | 0.425 | 0 | 0.18 |
| 2.36999999999998e-21 | 0 | 0.032 | 0.424 | 0 | 0.18 |
| 2.37499999999998e-21 | 0 | 0.032 | 0.423 | 0 | 0.179 |
| 2.37999999999998e-21 | 0 | 0.032 | 0.422 | 0 | 0.178 |
| 2.38499999999998e-21 | 0 | 0.032 | 0.422 | 0 | 0.178 |
| 2.38999999999998e-21 | 0 | 0.031 | 0.421 | 0 | 0.177 |
| 2.39499999999998e-21 | 0 | 0.031 | 0.42 | 0 | 0.176 |
| 2.39999999999998e-21 | 0 | 0.031 | 0.419 | 0 | 0.176 |
| 2.40499999999998e-21 | 0 | 0.031 | 0.419 | 0 | 0.175 |
| 2.40999999999998e-21 | 0 | 0.03 | 0.418 | 0 | 0.175 |
| 2.41499999999998e-21 | 0 | 0.03 | 0.417 | 0 | 0.174 |
| 2.41999999999998e-21 | 0 | 0.03 | 0.416 | 0 | 0.173 |
| 2.42499999999998e-21 | 0 | 0.03 | 0.416 | 0 | 0.173 |
| 2.42999999999998e-21 | 0 | 0.03 | 0.415 | 0 | 0.172 |
| 2.43499999999998e-21 | 0 | 0.029 | 0.414 | 0 | 0.171 |
| 2.43999999999998e-21 | 0 | 0.029 | 0.413 | 0 | 0.171 |
| 2.44499999999998e-21 | 0 | 0.029 | 0.413 | 0 | 0.17 |
| 2.44999999999998e-21 | 0 | 0.029 | 0.412 | 0 | 0.17 |
| 2.45499999999998e-21 | 0 | 0.029 | 0.411 | 0 | 0.169 |
| 2.45999999999998e-21 | 0 | 0.028 | 0.41 | 0 | 0.168 |
| 2.46499999999998e-21 | 0 | 0.028 | 0.41 | 0 | 0.168 |
| 2.46999999999998e-21 | 0 | 0.028 | 0.409 | 0 | 0.167 |
| 2.47499999999998e-21 | 0 | 0.028 | 0.408 | 0 | 0.167 |
| 2.47999999999998e-21 | 0 | 0.028 | 0.407 | 0 | 0.166 |
| 2.48499999999998e-21 | 0 | 0.027 | 0.407 | 0 | 0.165 |
| 2.48999999999998e-21 | 0 | 0.027 | 0.406 | 0 | 0.165 |
| 2.49499999999998e-21 | 0 | 0.027 | 0.405 | 0 | 0.164 |
| 2.49999999999998e-21 | 0 | 0.027 | 0.404 | 0 | 0.164 |
| 2.50499999999998e-21 | 0 | 0.027 | 0.404 | 0 | 0.163 |
| 2.50999999999998e-21 | 0 | 0.026 | 0.403 | 0 | 0.162 |
| 2.51499999999998e-21 | 0 | 0.026 | 0.402 | 0 | 0.162 |
| 2.51999999999998e-21 | 0 | 0.026 | 0.401 | 0 | 0.161 |
| 2.52499999999998e-21 | 0 | 0.026 | 0.401 | 0 | 0.161 |
| 2.52999999999998e-21 | 0 | 0.026 | 0.4 | 0 | 0.16 |
| 2.53499999999998e-21 | 0 | 0.025 | 0.399 | 0 | 0.159 |
| 2.53999999999998e-21 | 0 | 0.025 | 0.399 | 0 | 0.159 |
| 2.54499999999998e-21 | 0 | 0.025 | 0.398 | 0 | 0.158 |
| 2.54999999999998e-21 | 0 | 0.025 | 0.397 | 0 | 0.158 |
| 2.55499999999998e-21 | 0 | 0.025 | 0.396 | 0 | 0.157 |
| 2.55999999999998e-21 | 0 | 0.025 | 0.396 | 0 | 0.157 |
| 2.56499999999998e-21 | 0 | 0.024 | 0.395 | 0 | 0.156 |
| 2.56999999999998e-21 | 0 | 0.024 | 0.394 | 0 | 0.155 |
| 2.57499999999998e-21 | 0 | 0.024 | 0.394 | 0 | 0.155 |
| 2.57999999999998e-21 | 0 | 0.024 | 0.393 | 0 | 0.154 |
| 2.58499999999998e-21 | 0 | 0.024 | 0.392 | 0 | 0.154 |
| 2.58999999999998e-21 | 0 | 0.023 | 0.391 | 0 | 0.153 |
| 2.59499999999998e-21 | 0 | 0.023 | 0.391 | 0 | 0.153 |
| 2.59999999999998e-21 | 0 | 0.023 | 0.39 | 0 | 0.152 |
| 2.60499999999998e-21 | 0 | 0.023 | 0.389 | 0 | 0.152 |
| 2.60999999999998e-21 | 0 | 0.023 | 0.389 | 0 | 0.151 |
| 2.61499999999998e-21 | 0 | 0.023 | 0.388 | 0 | 0.15 |
| 2.61999999999998e-21 | 0 | 0.022 | 0.387 | 0 | 0.15 |
| 2.62499999999998e-21 | 0 | 0.022 | 0.386 | 0 | 0.149 |
| 2.62999999999998e-21 | 0 | 0.022 | 0.386 | 0 | 0.149 |
| 2.63499999999998e-21 | 0 | 0.022 | 0.385 | 0 | 0.148 |
| 2.63999999999998e-21 | 0 | 0.022 | 0.384 | 0 | 0.148 |
| 2.64499999999998e-21 | 0 | 0.022 | 0.384 | 0 | 0.147 |
| 2.64999999999998e-21 | 0 | 0.022 | 0.383 | 0 | 0.147 |
| 2.65499999999998e-21 | 0 | 0.021 | 0.382 | 0 | 0.146 |
| 2.65999999999998e-21 | 0 | 0.021 | 0.382 | 0 | 0.146 |
| 2.66499999999998e-21 | 0 | 0.021 | 0.381 | 0 | 0.145 |
| 2.66999999999998e-21 | 0 | 0.021 | 0.38 | 0 | 0.145 |
| 2.67499999999998e-21 | 0 | 0.021 | 0.38 | 0 | 0.144 |
| 2.67999999999998e-21 | 0 | 0.021 | 0.379 | 0 | 0.144 |
| 2.68499999999998e-21 | 0 | 0.02 | 0.378 | 0 | 0.143 |
| 2.68999999999998e-21 | 0 | 0.02 | 0.378 | 0 | 0.143 |
| 2.69499999999998e-21 | 0 | 0.02 | 0.377 | 0 | 0.142 |
| 2.69999999999998e-21 | 0 | 0.02 | 0.376 | 0 | 0.141 |
| 2.70499999999998e-21 | 0 | 0.02 | 0.375 | 0 | 0.141 |
| 2.70999999999998e-21 | 0 | 0.02 | 0.375 | 0 | 0.14 |
| 2.71499999999998e-21 | 0 | 0.02 | 0.374 | 0 | 0.14 |
| 2.71999999999998e-21 | 0 | 0.019 | 0.373 | 0 | 0.139 |
| 2.72499999999998e-21 | 0 | 0.019 | 0.373 | 0 | 0.139 |
| 2.72999999999998e-21 | 0 | 0.019 | 0.372 | 0 | 0.138 |
| 2.73499999999998e-21 | 0 | 0.019 | 0.371 | 0 | 0.138 |
| 2.73999999999998e-21 | 0 | 0.019 | 0.371 | 0 | 0.137 |
| 2.74499999999998e-21 | 0 | 0.019 | 0.37 | 0 | 0.137 |
| 2.74999999999998e-21 | 0 | 0.019 | 0.369 | 0 | 0.136 |
| 2.75499999999998e-21 | 0 | 0.018 | 0.369 | 0 | 0.136 |
| 2.75999999999998e-21 | 0 | 0.018 | 0.368 | 0 | 0.135 |
| 2.76499999999998e-21 | 0 | 0.018 | 0.367 | 0 | 0.135 |
| 2.76999999999998e-21 | 0 | 0.018 | 0.367 | 0 | 0.134 |
| 2.77499999999998e-21 | 0 | 0.018 | 0.366 | 0 | 0.134 |
| 2.77999999999998e-21 | 0 | 0.018 | 0.365 | 0 | 0.134 |
| 2.78499999999998e-21 | 0 | 0.018 | 0.365 | 0 | 0.133 |
| 2.78999999999998e-21 | 0 | 0.018 | 0.364 | 0 | 0.133 |
| 2.79499999999998e-21 | 0 | 0.017 | 0.363 | 0 | 0.132 |
| 2.79999999999998e-21 | 0 | 0.017 | 0.363 | 0 | 0.132 |
| 2.80499999999998e-21 | 0 | 0.017 | 0.362 | 0 | 0.131 |
| 2.80999999999998e-21 | 0 | 0.017 | 0.361 | 0 | 0.131 |
| 2.81499999999998e-21 | 0 | 0.017 | 0.361 | 0 | 0.13 |
| 2.81999999999998e-21 | 0 | 0.017 | 0.36 | 0 | 0.13 |
| 2.82499999999998e-21 | 0 | 0.017 | 0.359 | 0 | 0.129 |
| 2.82999999999998e-21 | 0 | 0.017 | 0.359 | 0 | 0.129 |
| 2.83499999999998e-21 | 0 | 0.016 | 0.358 | 0 | 0.128 |
| 2.83999999999998e-21 | 0 | 0.016 | 0.358 | 0 | 0.128 |
| 2.84499999999998e-21 | 0 | 0.016 | 0.357 | 0 | 0.127 |
| 2.84999999999998e-21 | 0 | 0.016 | 0.356 | 0 | 0.127 |
| 2.85499999999998e-21 | 0 | 0.016 | 0.356 | 0 | 0.126 |
| 2.85999999999998e-21 | 0 | 0.016 | 0.355 | 0 | 0.126 |
| 2.86499999999998e-21 | 0 | 0.016 | 0.354 | 0 | 0.126 |
| 2.86999999999998e-21 | 0 | 0.016 | 0.354 | 0 | 0.125 |
| 2.87499999999998e-21 | 0 | 0.016 | 0.353 | 0 | 0.125 |
| 2.87999999999998e-21 | 0 | 0.015 | 0.352 | 0 | 0.124 |
| 2.88499999999998e-21 | 0 | 0.015 | 0.352 | 0 | 0.124 |
| 2.88999999999998e-21 | 0 | 0.015 | 0.351 | 0 | 0.123 |
| 2.89499999999998e-21 | 0 | 0.015 | 0.35 | 0 | 0.123 |
| 2.89999999999998e-21 | 0 | 0.015 | 0.35 | 0 | 0.122 |
| 2.90499999999998e-21 | 0 | 0.015 | 0.349 | 0 | 0.122 |
| 2.90999999999998e-21 | 0 | 0.015 | 0.349 | 0 | 0.122 |
| 2.91499999999998e-21 | 0 | 0.015 | 0.348 | 0 | 0.121 |
| 2.91999999999998e-21 | 0 | 0.015 | 0.347 | 0 | 0.121 |
| 2.92499999999998e-21 | 0 | 0.014 | 0.347 | 0 | 0.12 |
| 2.92999999999998e-21 | 0 | 0.014 | 0.346 | 0 | 0.12 |
| 2.93499999999998e-21 | 0 | 0.014 | 0.345 | 0 | 0.119 |
| 2.93999999999998e-21 | 0 | 0.014 | 0.345 | 0 | 0.119 |
| 2.94499999999998e-21 | 0 | 0.014 | 0.344 | 0 | 0.118 |
| 2.94999999999998e-21 | 0 | 0.014 | 0.344 | 0 | 0.118 |
| 2.95499999999998e-21 | 0 | 0.014 | 0.343 | 0 | 0.118 |
| 2.95999999999998e-21 | 0 | 0.014 | 0.342 | 0 | 0.117 |
| 2.96499999999998e-21 | 0 | 0.014 | 0.342 | 0 | 0.117 |
| 2.96999999999998e-21 | 0 | 0.014 | 0.341 | 0 | 0.116 |
| 2.97499999999998e-21 | 0 | 0.013 | 0.34 | 0 | 0.116 |
| 2.97999999999998e-21 | 0 | 0.013 | 0.34 | 0 | 0.116 |
| 2.98499999999998e-21 | 0 | 0.013 | 0.339 | 0 | 0.115 |
| 2.98999999999998e-21 | 0 | 0.013 | 0.339 | 0 | 0.115 |
| 2.99499999999998e-21 | 0 | 0.013 | 0.338 | 0 | 0.114 |
| 2.99999999999998e-21 | 0 | 0.013 | 0.337 | 0 | 0.114 |
| 3.00499999999998e-21 | 0 | 0.013 | 0.337 | 0 | 0.113 |
| 3.00999999999998e-21 | 0 | 0.013 | 0.336 | 0 | 0.113 |
| 3.01499999999998e-21 | 0 | 0.013 | 0.336 | 0 | 0.113 |
| 3.01999999999998e-21 | 0 | 0.013 | 0.335 | 0 | 0.112 |
| 3.02499999999998e-21 | 0 | 0.013 | 0.334 | 0 | 0.112 |
| 3.02999999999998e-21 | 0 | 0.012 | 0.334 | 0 | 0.111 |
| 3.03499999999998e-21 | 0 | 0.012 | 0.333 | 0 | 0.111 |
| 3.03999999999998e-21 | 0 | 0.012 | 0.333 | 0 | 0.111 |
| 3.04499999999998e-21 | 0 | 0.012 | 0.332 | 0 | 0.11 |
| 3.04999999999998e-21 | 0 | 0.012 | 0.331 | 0 | 0.11 |
| 3.05499999999998e-21 | 0 | 0.012 | 0.331 | 0 | 0.109 |
| 3.05999999999998e-21 | 0 | 0.012 | 0.33 | 0 | 0.109 |
| 3.06499999999998e-21 | 0 | 0.012 | 0.33 | 0 | 0.109 |
| 3.06999999999998e-21 | 0 | 0.012 | 0.329 | 0 | 0.108 |
| 3.07499999999998e-21 | 0 | 0.012 | 0.328 | 0 | 0.108 |
| 3.07999999999998e-21 | 0 | 0.012 | 0.328 | 0 | 0.107 |
| 3.08499999999998e-21 | 0 | 0.011 | 0.327 | 0 | 0.107 |
| 3.08999999999998e-21 | 0 | 0.011 | 0.327 | 0 | 0.107 |
| 3.09499999999998e-21 | 0 | 0.011 | 0.326 | 0 | 0.106 |
| 3.09999999999998e-21 | 0 | 0.011 | 0.325 | 0 | 0.106 |
| 3.10499999999998e-21 | 0 | 0.011 | 0.325 | 0 | 0.106 |
| 3.10999999999998e-21 | 0 | 0.011 | 0.324 | 0 | 0.105 |
| 3.11499999999998e-21 | 0 | 0.011 | 0.324 | 0 | 0.105 |
| 3.11999999999998e-21 | 0 | 0.011 | 0.323 | 0 | 0.104 |
| 3.12499999999998e-21 | 0 | 0.011 | 0.322 | 0 | 0.104 |
| 3.12999999999998e-21 | 0 | 0.011 | 0.322 | 0 | 0.104 |
| 3.13499999999997e-21 | 0 | 0.011 | 0.321 | 0 | 0.103 |
| 3.13999999999997e-21 | 0 | 0.011 | 0.321 | 0 | 0.103 |
| 3.14499999999998e-21 | 0 | 0.011 | 0.32 | 0 | 0.102 |
| 3.14999999999998e-21 | 0 | 0.01 | 0.32 | 0 | 0.102 |
| 3.15499999999997e-21 | 0 | 0.01 | 0.319 | 0 | 0.102 |
| 3.15999999999997e-21 | 0 | 0.01 | 0.318 | 0 | 0.101 |
| 3.16499999999997e-21 | 0 | 0.01 | 0.318 | 0 | 0.101 |
| 3.16999999999997e-21 | 0 | 0.01 | 0.317 | 0 | 0.101 |
| 3.17499999999997e-21 | 0 | 0.01 | 0.317 | 0 | 0.1 |
| 3.17999999999997e-21 | 0 | 0.01 | 0.316 | 0 | 0.1 |
| 3.18499999999997e-21 | 0 | 0.01 | 0.316 | 0 | 0.1 |
| 3.18999999999997e-21 | 0 | 0.01 | 0.315 | 0 | 0.099 |
| 3.19499999999997e-21 | 0 | 0.01 | 0.314 | 0 | 0.099 |
| 3.19999999999997e-21 | 0 | 0.01 | 0.314 | 0 | 0.098 |
| 3.20499999999997e-21 | 0 | 0.01 | 0.313 | 0 | 0.098 |
| 3.20999999999997e-21 | 0 | 0.01 | 0.313 | 0 | 0.098 |
| 3.21499999999997e-21 | 0 | 0.009 | 0.312 | 0 | 0.097 |
| 3.21999999999997e-21 | 0 | 0.009 | 0.312 | 0 | 0.097 |
| 3.22499999999997e-21 | 0 | 0.009 | 0.311 | 0 | 0.097 |
| 3.22999999999997e-21 | 0 | 0.009 | 0.31 | 0 | 0.096 |
| 3.23499999999997e-21 | 0 | 0.009 | 0.31 | 0 | 0.096 |
| 3.23999999999997e-21 | 0 | 0.009 | 0.309 | 0 | 0.096 |
| 3.24499999999997e-21 | 0 | 0.009 | 0.309 | 0 | 0.095 |
| 3.24999999999997e-21 | 0 | 0.009 | 0.308 | 0 | 0.095 |
| 3.25499999999997e-21 | 0 | 0.009 | 0.308 | 0 | 0.095 |
| 3.25999999999997e-21 | 0 | 0.009 | 0.307 | 0 | 0.094 |
| 3.26499999999997e-21 | 0 | 0.009 | 0.307 | 0 | 0.094 |
| 3.26999999999997e-21 | 0 | 0.009 | 0.306 | 0 | 0.094 |
| 3.27499999999997e-21 | 0 | 0.009 | 0.305 | 0 | 0.093 |
| 3.27999999999997e-21 | 0 | 0.009 | 0.305 | 0 | 0.093 |
| 3.28499999999997e-21 | 0 | 0.009 | 0.304 | 0 | 0.093 |
| 3.28999999999997e-21 | 0 | 0.009 | 0.304 | 0 | 0.092 |
| 3.29499999999997e-21 | 0 | 0.008 | 0.303 | 0 | 0.092 |
| 3.29999999999997e-21 | 0 | 0.008 | 0.303 | 0 | 0.092 |
| 3.30499999999997e-21 | 0 | 0.008 | 0.302 | 0 | 0.091 |
| 3.30999999999997e-21 | 0 | 0.008 | 0.302 | 0 | 0.091 |
| 3.31499999999997e-21 | 0 | 0.008 | 0.301 | 0 | 0.091 |
| 3.31999999999997e-21 | 0 | 0.008 | 0.3 | 0 | 0.09 |
| 3.32499999999997e-21 | 0 | 0.008 | 0.3 | 0 | 0.09 |
| 3.32999999999997e-21 | 0 | 0.008 | 0.299 | 0 | 0.09 |
| 3.33499999999997e-21 | 0 | 0.008 | 0.299 | 0 | 0.089 |
| 3.33999999999997e-21 | 0 | 0.008 | 0.298 | 0 | 0.089 |
| 3.34499999999997e-21 | 0 | 0.008 | 0.298 | 0 | 0.089 |
| 3.34999999999997e-21 | 0 | 0.008 | 0.297 | 0 | 0.088 |
| 3.35499999999997e-21 | 0 | 0.008 | 0.297 | 0 | 0.088 |
| 3.35999999999997e-21 | 0 | 0.008 | 0.296 | 0 | 0.088 |
| 3.36499999999997e-21 | 0 | 0.008 | 0.296 | 0 | 0.087 |
| 3.36999999999997e-21 | 0 | 0.008 | 0.295 | 0 | 0.087 |
| 3.37499999999997e-21 | 0 | 0.008 | 0.295 | 0 | 0.087 |
| 3.37999999999997e-21 | 0 | 0.007 | 0.294 | 0 | 0.086 |
| 3.38499999999997e-21 | 0 | 0.007 | 0.294 | 0 | 0.086 |
| 3.38999999999997e-21 | 0 | 0.007 | 0.293 | 0 | 0.086 |
| 3.39499999999997e-21 | 0 | 0.007 | 0.292 | 0 | 0.086 |
| 3.39999999999997e-21 | 0 | 0.007 | 0.292 | 0 | 0.085 |
| 3.40499999999997e-21 | 0 | 0.007 | 0.291 | 0 | 0.085 |
| 3.40999999999997e-21 | 0 | 0.007 | 0.291 | 0 | 0.085 |
| 3.41499999999997e-21 | 0 | 0.007 | 0.29 | 0 | 0.084 |
| 3.41999999999997e-21 | 0 | 0.007 | 0.29 | 0 | 0.084 |
| 3.42499999999997e-21 | 0 | 0.007 | 0.289 | 0 | 0.084 |
| 3.42999999999997e-21 | 0 | 0.007 | 0.289 | 0 | 0.083 |
| 3.43499999999997e-21 | 0 | 0.007 | 0.288 | 0 | 0.083 |
| 3.43999999999998e-21 | 0 | 0.007 | 0.288 | 0 | 0.083 |
| 3.44499999999998e-21 | 0 | 0.007 | 0.287 | 0 | 0.082 |
| 3.44999999999998e-21 | 0 | 0.007 | 0.287 | 0 | 0.082 |
| 3.45499999999998e-21 | 0 | 0.007 | 0.286 | 0 | 0.082 |
| 3.45999999999998e-21 | 0 | 0.007 | 0.286 | 0 | 0.082 |
| 3.46499999999998e-21 | 0 | 0.007 | 0.285 | 0 | 0.081 |
| 3.46999999999998e-21 | 0 | 0.007 | 0.285 | 0 | 0.081 |
| 3.47499999999998e-21 | 0 | 0.007 | 0.284 | 0 | 0.081 |
| 3.47999999999998e-21 | 0 | 0.006 | 0.284 | 0 | 0.08 |
| 3.48499999999998e-21 | 0 | 0.006 | 0.283 | 0 | 0.08 |
| 3.48999999999998e-21 | 0 | 0.006 | 0.283 | 0 | 0.08 |
| 3.49499999999998e-21 | 0 | 0.006 | 0.282 | 0 | 0.08 |
| 3.49999999999998e-21 | 0 | 0.006 | 0.282 | 0 | 0.079 |
| 3.50499999999998e-21 | 0 | 0.006 | 0.281 | 0 | 0.079 |
| 3.50999999999998e-21 | 0 | 0.006 | 0.281 | 0 | 0.079 |
| 3.51499999999998e-21 | 0 | 0.006 | 0.28 | 0 | 0.078 |
| 3.51999999999998e-21 | 0 | 0.006 | 0.279 | 0 | 0.078 |
| 3.52499999999998e-21 | 0 | 0.006 | 0.279 | 0 | 0.078 |
| 3.52999999999998e-21 | 0 | 0.006 | 0.278 | 0 | 0.078 |
| 3.53499999999998e-21 | 0 | 0.006 | 0.278 | 0 | 0.077 |
| 3.53999999999998e-21 | 0 | 0.006 | 0.277 | 0 | 0.077 |
| 3.54499999999998e-21 | 0 | 0.006 | 0.277 | 0 | 0.077 |
| 3.54999999999998e-21 | 0 | 0.006 | 0.276 | 0 | 0.076 |
| 3.55499999999998e-21 | 0 | 0.006 | 0.276 | 0 | 0.076 |
| 3.55999999999998e-21 | 0 | 0.006 | 0.275 | 0 | 0.076 |
| 3.56499999999998e-21 | 0 | 0.006 | 0.275 | 0 | 0.076 |
| 3.56999999999998e-21 | 0 | 0.006 | 0.274 | 0 | 0.075 |
| 3.57499999999998e-21 | 0 | 0.006 | 0.274 | 0 | 0.075 |
| 3.57999999999998e-21 | 0 | 0.006 | 0.273 | 0 | 0.075 |
| 3.58499999999998e-21 | 0 | 0.006 | 0.273 | 0 | 0.075 |
| 3.58999999999998e-21 | 0 | 0.006 | 0.273 | 0 | 0.074 |
| 3.59499999999999e-21 | 0 | 0.005 | 0.272 | 0 | 0.074 |
| 3.59999999999999e-21 | 0 | 0.005 | 0.272 | 0 | 0.074 |
| 3.60499999999999e-21 | 0 | 0.005 | 0.271 | 0 | 0.073 |
| 3.60999999999999e-21 | 0 | 0.005 | 0.271 | 0 | 0.073 |
| 3.61499999999999e-21 | 0 | 0.005 | 0.27 | 0 | 0.073 |
| 3.61999999999999e-21 | 0 | 0.005 | 0.27 | 0 | 0.073 |
| 3.62499999999999e-21 | 0 | 0.005 | 0.269 | 0 | 0.072 |
| 3.62999999999999e-21 | 0 | 0.005 | 0.269 | 0 | 0.072 |
| 3.63499999999999e-21 | 0 | 0.005 | 0.268 | 0 | 0.072 |
| 3.63999999999999e-21 | 0 | 0.005 | 0.268 | 0 | 0.072 |
| 3.64499999999999e-21 | 0 | 0.005 | 0.267 | 0 | 0.071 |
| 3.64999999999999e-21 | 0 | 0.005 | 0.267 | 0 | 0.071 |
| 3.65499999999999e-21 | 0 | 0.005 | 0.266 | 0 | 0.071 |
| 3.65999999999999e-21 | 0 | 0.005 | 0.266 | 0 | 0.071 |
| 3.66499999999999e-21 | 0 | 0.005 | 0.265 | 0 | 0.07 |
| 3.66999999999999e-21 | 0 | 0.005 | 0.265 | 0 | 0.07 |
| 3.67499999999999e-21 | 0 | 0.005 | 0.264 | 0 | 0.07 |
| 3.68e-21 | 0 | 0.005 | 0.264 | 0 | 0.07 |
| 3.685e-21 | 0 | 0.005 | 0.263 | 0 | 0.069 |
| 3.68999999999999e-21 | 0 | 0.005 | 0.263 | 0 | 0.069 |
| 3.69499999999999e-21 | 0 | 0.005 | 0.262 | 0 | 0.069 |
| 3.69999999999999e-21 | 0 | 0.005 | 0.262 | 0 | 0.069 |
| 3.70499999999999e-21 | 0 | 0.005 | 0.261 | 0 | 0.068 |
| 3.70999999999999e-21 | 0 | 0.005 | 0.261 | 0 | 0.068 |
| 3.71499999999999e-21 | 0 | 0.005 | 0.26 | 0 | 0.068 |
| 3.71999999999999e-21 | 0 | 0.005 | 0.26 | 0 | 0.068 |
| 3.72499999999999e-21 | 0 | 0.005 | 0.259 | 0 | 0.067 |
| 3.72999999999999e-21 | 0 | 0.005 | 0.259 | 0 | 0.067 |
| 3.73499999999999e-21 | 0 | 0.004 | 0.259 | 0 | 0.067 |
| 3.73999999999999e-21 | 0 | 0.004 | 0.258 | 0 | 0.067 |
| 3.74499999999999e-21 | 0 | 0.004 | 0.258 | 0 | 0.066 |
| 3.74999999999999e-21 | 0 | 0.004 | 0.257 | 0 | 0.066 |
| 3.75499999999999e-21 | 0 | 0.004 | 0.257 | 0 | 0.066 |
| 3.76e-21 | 0 | 0.004 | 0.256 | 0 | 0.066 |
| 3.765e-21 | 0 | 0.004 | 0.256 | 0 | 0.065 |
| 3.77e-21 | 0 | 0.004 | 0.255 | 0 | 0.065 |
| 3.775e-21 | 0 | 0.004 | 0.255 | 0 | 0.065 |
| 3.78e-21 | 0 | 0.004 | 0.254 | 0 | 0.065 |
| 3.785e-21 | 0 | 0.004 | 0.254 | 0 | 0.064 |
| 3.79e-21 | 0 | 0.004 | 0.253 | 0 | 0.064 |
| 3.795e-21 | 0 | 0.004 | 0.253 | 0 | 0.064 |
| 3.8e-21 | 0 | 0.004 | 0.253 | 0 | 0.064 |
| 3.805e-21 | 0 | 0.004 | 0.252 | 0 | 0.064 |
| 3.81e-21 | 0 | 0.004 | 0.252 | 0 | 0.063 |
| 3.815e-21 | 0 | 0.004 | 0.251 | 0 | 0.063 |
| 3.82e-21 | 0 | 0.004 | 0.251 | 0 | 0.063 |
| 3.825e-21 | 0 | 0.004 | 0.25 | 0 | 0.063 |
| 3.83e-21 | 0 | 0.004 | 0.25 | 0 | 0.062 |
| 3.835e-21 | 0 | 0.004 | 0.249 | 0 | 0.062 |
| 3.84e-21 | 0 | 0.004 | 0.249 | 0 | 0.062 |
| 3.845e-21 | 0 | 0.004 | 0.248 | 0 | 0.062 |
| 3.85e-21 | 0 | 0.004 | 0.248 | 0 | 0.062 |
| 3.855e-21 | 0 | 0.004 | 0.248 | 0 | 0.061 |
| 3.86e-21 | 0 | 0.004 | 0.247 | 0 | 0.061 |
| 3.865e-21 | 0 | 0.004 | 0.247 | 0 | 0.061 |
| 3.87e-21 | 0 | 0.004 | 0.246 | 0 | 0.061 |
| 3.875e-21 | 0 | 0.004 | 0.246 | 0 | 0.06 |
| 3.88e-21 | 0 | 0.004 | 0.245 | 0 | 0.06 |
| 3.885e-21 | 0 | 0.004 | 0.245 | 0 | 0.06 |
| 3.89e-21 | 0 | 0.004 | 0.244 | 0 | 0.06 |
| 3.895e-21 | 0 | 0.004 | 0.244 | 0 | 0.06 |
| 3.9e-21 | 0 | 0.004 | 0.244 | 0 | 0.059 |
| 3.905e-21 | 0 | 0.003 | 0.243 | 0 | 0.059 |
| 3.91000000000001e-21 | 0 | 0.003 | 0.243 | 0 | 0.059 |
| 3.91500000000001e-21 | 0 | 0.003 | 0.242 | 0 | 0.059 |
| 3.92000000000001e-21 | 0 | 0.003 | 0.242 | 0 | 0.058 |
| 3.92500000000001e-21 | 0 | 0.003 | 0.241 | 0 | 0.058 |
| 3.93000000000001e-21 | 0 | 0.003 | 0.241 | 0 | 0.058 |
| 3.93500000000001e-21 | 0 | 0.003 | 0.24 | 0 | 0.058 |
| 3.94000000000001e-21 | 0 | 0.003 | 0.24 | 0 | 0.058 |
| 3.94500000000001e-21 | 0 | 0.003 | 0.24 | 0 | 0.057 |
| 3.95000000000001e-21 | 0 | 0.003 | 0.239 | 0 | 0.057 |
| 3.95500000000001e-21 | 0 | 0.003 | 0.239 | 0 | 0.057 |
| 3.96000000000001e-21 | 0 | 0.003 | 0.238 | 0 | 0.057 |
| 3.96500000000001e-21 | 0 | 0.003 | 0.238 | 0 | 0.057 |
| 3.97000000000001e-21 | 0 | 0.003 | 0.237 | 0 | 0.056 |
| 3.97500000000001e-21 | 0 | 0.003 | 0.237 | 0 | 0.056 |
| 3.98000000000001e-21 | 0 | 0.003 | 0.237 | 0 | 0.056 |
| 3.98500000000001e-21 | 0 | 0.003 | 0.236 | 0 | 0.056 |
| 3.99000000000001e-21 | 0 | 0.003 | 0.236 | 0 | 0.056 |
| 3.99500000000001e-21 | 0 | 0.003 | 0.235 | 0 | 0.055 |
| 4.00000000000001e-21 | 0 | 0.003 | 0.235 | 0 | 0.055 |
| 4.00500000000001e-21 | 0 | 0.003 | 0.234 | 0 | 0.055 |
| 4.01000000000001e-21 | 0 | 0.003 | 0.234 | 0 | 0.055 |
| 4.01500000000001e-21 | 0 | 0.003 | 0.234 | 0 | 0.055 |
| 4.02000000000001e-21 | 0 | 0.003 | 0.233 | 0 | 0.054 |
| 4.02500000000001e-21 | 0 | 0.003 | 0.233 | 0 | 0.054 |
| 4.03000000000001e-21 | 0 | 0.003 | 0.232 | 0 | 0.054 |
| 4.03500000000001e-21 | 0 | 0.003 | 0.232 | 0 | 0.054 |
| 4.04000000000001e-21 | 0 | 0.003 | 0.232 | 0 | 0.054 |
| 4.04500000000001e-21 | 0 | 0.003 | 0.231 | 0 | 0.053 |
| 4.05000000000001e-21 | 0 | 0.003 | 0.231 | 0 | 0.053 |
| 4.05500000000001e-21 | 0 | 0.003 | 0.23 | 0 | 0.053 |
| 4.06000000000001e-21 | 0 | 0.003 | 0.23 | 0 | 0.053 |
| 4.06500000000001e-21 | 0 | 0.003 | 0.229 | 0 | 0.053 |
| 4.07000000000002e-21 | 0 | 0.003 | 0.229 | 0 | 0.052 |
| 4.07500000000002e-21 | 0 | 0.003 | 0.229 | 0 | 0.052 |
| 4.08000000000002e-21 | 0 | 0.003 | 0.228 | 0 | 0.052 |
| 4.08500000000002e-21 | 0 | 0.003 | 0.228 | 0 | 0.052 |
| 4.09000000000002e-21 | 0 | 0.003 | 0.227 | 0 | 0.052 |
| 4.09500000000002e-21 | 0 | 0.003 | 0.227 | 0 | 0.052 |
| 4.10000000000002e-21 | 0 | 0.003 | 0.227 | 0 | 0.051 |
| 4.10500000000002e-21 | 0 | 0.003 | 0.226 | 0 | 0.051 |
| 4.11000000000002e-21 | 0 | 0.003 | 0.226 | 0 | 0.051 |
| 4.11500000000002e-21 | 0 | 0.003 | 0.225 | 0 | 0.051 |
| 4.12000000000002e-21 | 0 | 0.003 | 0.225 | 0 | 0.051 |
| 4.12500000000002e-21 | 0 | 0.003 | 0.225 | 0 | 0.05 |
| 4.13000000000002e-21 | 0 | 0.003 | 0.224 | 0 | 0.05 |
| 4.13500000000002e-21 | 0 | 0.003 | 0.224 | 0 | 0.05 |
| 4.14000000000002e-21 | 0 | 0.002 | 0.223 | 0 | 0.05 |
| 4.14500000000002e-21 | 0 | 0.002 | 0.223 | 0 | 0.05 |
| 4.15000000000002e-21 | 0 | 0.002 | 0.222 | 0 | 0.049 |
| 4.15500000000002e-21 | 0 | 0.002 | 0.222 | 0 | 0.049 |
| 4.16000000000002e-21 | 0 | 0.002 | 0.222 | 0 | 0.049 |
| 4.16500000000002e-21 | 0 | 0.002 | 0.221 | 0 | 0.049 |
| 4.17000000000002e-21 | 0 | 0.002 | 0.221 | 0 | 0.049 |
| 4.17500000000002e-21 | 0 | 0.002 | 0.22 | 0 | 0.049 |
| 4.18000000000002e-21 | 0 | 0.002 | 0.22 | 0 | 0.048 |
| 4.18500000000002e-21 | 0 | 0.002 | 0.22 | 0 | 0.048 |
| 4.19000000000002e-21 | 0 | 0.002 | 0.219 | 0 | 0.048 |
| 4.19500000000002e-21 | 0 | 0.002 | 0.219 | 0 | 0.048 |
| 4.20000000000002e-21 | 0 | 0.002 | 0.218 | 0 | 0.048 |
| 4.20500000000002e-21 | 0 | 0.002 | 0.218 | 0 | 0.048 |
| 4.21000000000002e-21 | 0 | 0.002 | 0.218 | 0 | 0.047 |
| 4.21500000000002e-21 | 0 | 0.002 | 0.217 | 0 | 0.047 |
| 4.22000000000002e-21 | 0 | 0.002 | 0.217 | 0 | 0.047 |
| 4.22500000000002e-21 | 0 | 0.002 | 0.217 | 0 | 0.047 |
| 4.23000000000003e-21 | 0 | 0.002 | 0.216 | 0 | 0.047 |
| 4.23500000000003e-21 | 0 | 0.002 | 0.216 | 0 | 0.047 |
| 4.24000000000003e-21 | 0 | 0.002 | 0.215 | 0 | 0.046 |
| 4.24500000000003e-21 | 0 | 0.002 | 0.215 | 0 | 0.046 |
| 4.25000000000003e-21 | 0 | 0.002 | 0.215 | 0 | 0.046 |
| 4.25500000000003e-21 | 0 | 0.002 | 0.214 | 0 | 0.046 |
| 4.26000000000003e-21 | 0 | 0.002 | 0.214 | 0 | 0.046 |
| 4.26500000000003e-21 | 0 | 0.002 | 0.213 | 0 | 0.046 |
| 4.27000000000003e-21 | 0 | 0.002 | 0.213 | 0 | 0.045 |
| 4.27500000000003e-21 | 0 | 0.002 | 0.213 | 0 | 0.045 |
| 4.28000000000003e-21 | 0 | 0.002 | 0.212 | 0 | 0.045 |
| 4.28500000000003e-21 | 0 | 0.002 | 0.212 | 0 | 0.045 |
| 4.29000000000003e-21 | 0 | 0.002 | 0.211 | 0 | 0.045 |
| 4.29500000000003e-21 | 0 | 0.002 | 0.211 | 0 | 0.045 |
| 4.30000000000003e-21 | 0 | 0.002 | 0.211 | 0 | 0.044 |
| 4.30500000000003e-21 | 0 | 0.002 | 0.21 | 0 | 0.044 |
| 4.31000000000003e-21 | 0 | 0.002 | 0.21 | 0 | 0.044 |
| 4.31500000000003e-21 | 0 | 0.002 | 0.21 | 0 | 0.044 |
| 4.32000000000003e-21 | 0 | 0.002 | 0.209 | 0 | 0.044 |
| 4.32500000000003e-21 | 0 | 0.002 | 0.209 | 0 | 0.044 |
| 4.33000000000003e-21 | 0 | 0.002 | 0.208 | 0 | 0.043 |
| 4.33500000000003e-21 | 0 | 0.002 | 0.208 | 0 | 0.043 |
| 4.34000000000003e-21 | 0 | 0.002 | 0.208 | 0 | 0.043 |
| 4.34500000000003e-21 | 0 | 0.002 | 0.207 | 0 | 0.043 |
| 4.35000000000003e-21 | 0 | 0.002 | 0.207 | 0 | 0.043 |
| 4.35500000000003e-21 | 0 | 0.002 | 0.207 | 0 | 0.043 |
| 4.36000000000003e-21 | 0 | 0.002 | 0.206 | 0 | 0.043 |
| 4.36500000000003e-21 | 0 | 0.002 | 0.206 | 0 | 0.042 |
| 4.37000000000003e-21 | 0 | 0.002 | 0.205 | 0 | 0.042 |
| 4.37500000000003e-21 | 0 | 0.002 | 0.205 | 0 | 0.042 |
| 4.38000000000003e-21 | 0 | 0.002 | 0.205 | 0 | 0.042 |
| 4.38500000000003e-21 | 0 | 0.002 | 0.204 | 0 | 0.042 |
| 4.39000000000004e-21 | 0 | 0.002 | 0.204 | 0 | 0.042 |
| 4.39500000000004e-21 | 0 | 0.002 | 0.204 | 0 | 0.041 |
| 4.40000000000004e-21 | 0 | 0.002 | 0.203 | 0 | 0.041 |
| 4.40500000000004e-21 | 0 | 0.002 | 0.203 | 0 | 0.041 |
| 4.41000000000004e-21 | 0 | 0.002 | 0.202 | 0 | 0.041 |
| 4.41500000000004e-21 | 0 | 0.002 | 0.202 | 0 | 0.041 |
| 4.42000000000004e-21 | 0 | 0.002 | 0.202 | 0 | 0.041 |
| 4.42500000000004e-21 | 0 | 0.002 | 0.201 | 0 | 0.041 |
| 4.43000000000004e-21 | 0 | 0.002 | 0.201 | 0 | 0.04 |
| 4.43500000000004e-21 | 0 | 0.002 | 0.201 | 0 | 0.04 |
| 4.44000000000004e-21 | 0 | 0.002 | 0.2 | 0 | 0.04 |
| 4.44500000000004e-21 | 0 | 0.002 | 0.2 | 0 | 0.04 |
| 4.45000000000004e-21 | 0 | 0.002 | 0.2 | 0 | 0.04 |
| 4.45500000000004e-21 | 0 | 0.002 | 0.199 | 0 | 0.04 |
| 4.46000000000004e-21 | 0 | 0.002 | 0.199 | 0 | 0.04 |
| 4.46500000000004e-21 | 0 | 0.002 | 0.198 | 0 | 0.039 |
| 4.47000000000004e-21 | 0 | 0.002 | 0.198 | 0 | 0.039 |
| 4.47500000000004e-21 | 0 | 0.002 | 0.198 | 0 | 0.039 |
| 4.48000000000004e-21 | 0 | 0.002 | 0.197 | 0 | 0.039 |
| 4.48500000000004e-21 | 0 | 0.002 | 0.197 | 0 | 0.039 |
| 4.49000000000004e-21 | 0 | 0.001 | 0.197 | 0 | 0.039 |
| 4.49500000000004e-21 | 0 | 0.001 | 0.196 | 0 | 0.039 |
| 4.50000000000004e-21 | 0 | 0.001 | 0.196 | 0 | 0.038 |
| 4.50500000000004e-21 | 0 | 0.001 | 0.196 | 0 | 0.038 |
| 4.51000000000004e-21 | 0 | 0.001 | 0.195 | 0 | 0.038 |
| 4.51500000000004e-21 | 0 | 0.001 | 0.195 | 0 | 0.038 |
| 4.52000000000004e-21 | 0 | 0.001 | 0.195 | 0 | 0.038 |
| 4.52500000000004e-21 | 0 | 0.001 | 0.194 | 0 | 0.038 |
| 4.53000000000004e-21 | 0 | 0.001 | 0.194 | 0 | 0.038 |
| 4.53500000000004e-21 | 0 | 0.001 | 0.194 | 0 | 0.037 |
| 4.54000000000004e-21 | 0 | 0.001 | 0.193 | 0 | 0.037 |
| 4.54500000000005e-21 | 0 | 0.001 | 0.193 | 0 | 0.037 |
| 4.55000000000005e-21 | 0 | 0.001 | 0.192 | 0 | 0.037 |
| 4.55500000000005e-21 | 0 | 0.001 | 0.192 | 0 | 0.037 |
| 4.56000000000005e-21 | 0 | 0.001 | 0.192 | 0 | 0.037 |
| 4.56500000000005e-21 | 0 | 0.001 | 0.191 | 0 | 0.037 |
| 4.57000000000005e-21 | 0 | 0.001 | 0.191 | 0 | 0.037 |
| 4.57500000000005e-21 | 0 | 0.001 | 0.191 | 0 | 0.036 |
| 4.58000000000005e-21 | 0 | 0.001 | 0.19 | 0 | 0.036 |
| 4.58500000000005e-21 | 0 | 0.001 | 0.19 | 0 | 0.036 |
| 4.59000000000005e-21 | 0 | 0.001 | 0.19 | 0 | 0.036 |
| 4.59500000000005e-21 | 0 | 0.001 | 0.189 | 0 | 0.036 |
| 4.60000000000005e-21 | 0 | 0.001 | 0.189 | 0 | 0.036 |
| 4.60500000000005e-21 | 0 | 0.001 | 0.189 | 0 | 0.036 |
| 4.61000000000005e-21 | 0 | 0.001 | 0.188 | 0 | 0.035 |
| 4.61500000000005e-21 | 0 | 0.001 | 0.188 | 0 | 0.035 |
| 4.62000000000005e-21 | 0 | 0.001 | 0.188 | 0 | 0.035 |
| 4.62500000000005e-21 | 0 | 0.001 | 0.187 | 0 | 0.035 |
| 4.63000000000005e-21 | 0 | 0.001 | 0.187 | 0 | 0.035 |
| 4.63500000000005e-21 | 0 | 0.001 | 0.187 | 0 | 0.035 |
| 4.64000000000005e-21 | 0 | 0.001 | 0.186 | 0 | 0.035 |
| 4.64500000000005e-21 | 0 | 0.001 | 0.186 | 0 | 0.035 |
| 4.65000000000005e-21 | 0 | 0.001 | 0.186 | 0 | 0.034 |
| 4.65500000000005e-21 | 0 | 0.001 | 0.185 | 0 | 0.034 |
| 4.66000000000005e-21 | 0 | 0.001 | 0.185 | 0 | 0.034 |
| 4.66500000000005e-21 | 0 | 0.001 | 0.185 | 0 | 0.034 |
| 4.67000000000005e-21 | 0 | 0.001 | 0.184 | 0 | 0.034 |
| 4.67500000000005e-21 | 0 | 0.001 | 0.184 | 0 | 0.034 |
| 4.68000000000005e-21 | 0 | 0.001 | 0.184 | 0 | 0.034 |
| 4.68500000000005e-21 | 0 | 0.001 | 0.183 | 0 | 0.034 |
| 4.69000000000005e-21 | 0 | 0.001 | 0.183 | 0 | 0.033 |
| 4.69500000000005e-21 | 0 | 0.001 | 0.183 | 0 | 0.033 |
| 4.70000000000005e-21 | 0 | 0.001 | 0.182 | 0 | 0.033 |
| 4.70500000000006e-21 | 0 | 0.001 | 0.182 | 0 | 0.033 |
| 4.71000000000005e-21 | 0 | 0.001 | 0.182 | 0 | 0.033 |
| 4.71500000000006e-21 | 0 | 0.001 | 0.181 | 0 | 0.033 |
| 4.72000000000006e-21 | 0 | 0.001 | 0.181 | 0 | 0.033 |
| 4.72500000000006e-21 | 0 | 0.001 | 0.181 | 0 | 0.033 |
| 4.73000000000006e-21 | 0 | 0.001 | 0.18 | 0 | 0.033 |
| 4.73500000000006e-21 | 0 | 0.001 | 0.18 | 0 | 0.032 |
| 4.74000000000006e-21 | 0 | 0.001 | 0.18 | 0 | 0.032 |
| 4.74500000000006e-21 | 0 | 0.001 | 0.179 | 0 | 0.032 |
| 4.75000000000006e-21 | 0 | 0.001 | 0.179 | 0 | 0.032 |
| 4.75500000000006e-21 | 0 | 0.001 | 0.179 | 0 | 0.032 |
| 4.76000000000006e-21 | 0 | 0.001 | 0.178 | 0 | 0.032 |
| 4.76500000000006e-21 | 0 | 0.001 | 0.178 | 0 | 0.032 |
| 4.77000000000006e-21 | 0 | 0.001 | 0.178 | 0 | 0.032 |
| 4.77500000000006e-21 | 0 | 0.001 | 0.177 | 0 | 0.031 |
| 4.78000000000006e-21 | 0 | 0.001 | 0.177 | 0 | 0.031 |
| 4.78500000000006e-21 | 0 | 0.001 | 0.177 | 0 | 0.031 |
| 4.79000000000006e-21 | 0 | 0.001 | 0.176 | 0 | 0.031 |
| 4.79500000000006e-21 | 0 | 0.001 | 0.176 | 0 | 0.031 |
| 4.80000000000006e-21 | 0 | 0.001 | 0.176 | 0 | 0.031 |
| 4.80500000000006e-21 | 0 | 0.001 | 0.175 | 0 | 0.031 |
| 4.81000000000006e-21 | 0 | 0.001 | 0.175 | 0 | 0.031 |
| 4.81500000000006e-21 | 0 | 0.001 | 0.175 | 0 | 0.031 |
| 4.82000000000006e-21 | 0 | 0.001 | 0.175 | 0 | 0.03 |
| 4.82500000000006e-21 | 0 | 0.001 | 0.174 | 0 | 0.03 |
| 4.83000000000006e-21 | 0 | 0.001 | 0.174 | 0 | 0.03 |
| 4.83500000000006e-21 | 0 | 0.001 | 0.174 | 0 | 0.03 |
| 4.84000000000006e-21 | 0 | 0.001 | 0.173 | 0 | 0.03 |
| 4.84500000000006e-21 | 0 | 0.001 | 0.173 | 0 | 0.03 |
| 4.85000000000006e-21 | 0 | 0.001 | 0.173 | 0 | 0.03 |
| 4.85500000000006e-21 | 0 | 0.001 | 0.172 | 0 | 0.03 |
| 4.86000000000007e-21 | 0 | 0.001 | 0.172 | 0 | 0.03 |
| 4.86500000000006e-21 | 0 | 0.001 | 0.172 | 0 | 0.029 |
| 4.87000000000007e-21 | 0 | 0.001 | 0.171 | 0 | 0.029 |
| 4.87500000000007e-21 | 0 | 0.001 | 0.171 | 0 | 0.029 |
| 4.88000000000007e-21 | 0 | 0.001 | 0.171 | 0 | 0.029 |
| 4.88500000000007e-21 | 0 | 0.001 | 0.17 | 0 | 0.029 |
| 4.89000000000007e-21 | 0 | 0.001 | 0.17 | 0 | 0.029 |
| 4.89500000000007e-21 | 0 | 0.001 | 0.17 | 0 | 0.029 |
| 4.90000000000007e-21 | 0 | 0.001 | 0.17 | 0 | 0.029 |
| 4.90500000000007e-21 | 0 | 0.001 | 0.169 | 0 | 0.029 |
| 4.91000000000007e-21 | 0 | 0.001 | 0.169 | 0 | 0.029 |
| 4.91500000000007e-21 | 0 | 0.001 | 0.169 | 0 | 0.028 |
| 4.92000000000007e-21 | 0 | 0.001 | 0.168 | 0 | 0.028 |
| 4.92500000000007e-21 | 0 | 0.001 | 0.168 | 0 | 0.028 |
| 4.93000000000007e-21 | 0 | 0.001 | 0.168 | 0 | 0.028 |
| 4.93500000000007e-21 | 0 | 0.001 | 0.167 | 0 | 0.028 |
| 4.94000000000007e-21 | 0 | 0.001 | 0.167 | 0 | 0.028 |
| 4.94500000000007e-21 | 0 | 0.001 | 0.167 | 0 | 0.028 |
| 4.95000000000007e-21 | 0 | 0.001 | 0.167 | 0 | 0.028 |
| 4.95500000000007e-21 | 0 | 0.001 | 0.166 | 0 | 0.028 |
| 4.96000000000007e-21 | 0 | 0.001 | 0.166 | 0 | 0.028 |
| 4.96500000000007e-21 | 0 | 0.001 | 0.166 | 0 | 0.027 |
| 4.97000000000007e-21 | 0 | 0.001 | 0.165 | 0 | 0.027 |
| 4.97500000000007e-21 | 0 | 0.001 | 0.165 | 0 | 0.027 |
| 4.98000000000007e-21 | 0 | 0.001 | 0.165 | 0 | 0.027 |
| 4.98500000000007e-21 | 0 | 0.001 | 0.164 | 0 | 0.027 |
| 4.99000000000007e-21 | 0 | 0.001 | 0.164 | 0 | 0.027 |
| 4.99500000000007e-21 | 0 | 0.001 | 0.164 | 0 | 0.027 |
| 5.00000000000007e-21 | 0 | 0.001 | 0.164 | 0 | 0.027 |
| 5.00500000000007e-21 | 0 | 0.001 | 0.163 | 0 | 0.027 |
| 5.01000000000007e-21 | 0 | 0.001 | 0.163 | 0 | 0.027 |
| 5.01500000000007e-21 | 0 | 0.001 | 0.163 | 0 | 0.026 |
| 5.02000000000008e-21 | 0 | 0.001 | 0.162 | 0 | 0.026 |
| 5.02500000000007e-21 | 0 | 0.001 | 0.162 | 0 | 0.026 |
| 5.03000000000008e-21 | 0 | 0.001 | 0.162 | 0 | 0.026 |
| 5.03500000000008e-21 | 0 | 0.001 | 0.161 | 0 | 0.026 |
| 5.04000000000008e-21 | 0 | 0.001 | 0.161 | 0 | 0.026 |
| 5.04500000000008e-21 | 0 | 0.001 | 0.161 | 0 | 0.026 |
| 5.05000000000008e-21 | 0 | 0.001 | 0.161 | 0 | 0.026 |
| 5.05500000000008e-21 | 0 | 0.001 | 0.16 | 0 | 0.026 |
| 5.06000000000008e-21 | 0 | 0.001 | 0.16 | 0 | 0.026 |
| 5.06500000000008e-21 | 0 | 0.001 | 0.16 | 0 | 0.026 |
| 5.07000000000008e-21 | 0 | 0.001 | 0.159 | 0 | 0.025 |
| 5.07500000000008e-21 | 0 | 0.001 | 0.159 | 0 | 0.025 |
| 5.08000000000008e-21 | 0 | 0.001 | 0.159 | 0 | 0.025 |
| 5.08500000000008e-21 | 0 | 0.001 | 0.159 | 0 | 0.025 |
| 5.09000000000008e-21 | 0 | 0.001 | 0.158 | 0 | 0.025 |
| 5.09500000000008e-21 | 0 | 0.001 | 0.158 | 0 | 0.025 |
| 5.10000000000008e-21 | 0 | 0.001 | 0.158 | 0 | 0.025 |
| 5.10500000000008e-21 | 0 | 0.001 | 0.157 | 0 | 0.025 |
| 5.11000000000008e-21 | 0 | 0.001 | 0.157 | 0 | 0.025 |
| 5.11500000000008e-21 | 0 | 0.001 | 0.157 | 0 | 0.025 |
| 5.12000000000008e-21 | 0 | 0.001 | 0.157 | 0 | 0.025 |
| 5.12500000000008e-21 | 0 | 0.001 | 0.156 | 0 | 0.024 |
| 5.13000000000008e-21 | 0 | 0.001 | 0.156 | 0 | 0.024 |
| 5.13500000000008e-21 | 0 | 0.001 | 0.156 | 0 | 0.024 |
| 5.14000000000008e-21 | 0 | 0.001 | 0.155 | 0 | 0.024 |
| 5.14500000000008e-21 | 0 | 0.001 | 0.155 | 0 | 0.024 |
| 5.15000000000008e-21 | 0 | 0.001 | 0.155 | 0 | 0.024 |
| 5.15500000000008e-21 | 0 | 0.001 | 0.155 | 0 | 0.024 |
| 5.16000000000008e-21 | 0 | 0.001 | 0.154 | 0 | 0.024 |
| 5.16500000000008e-21 | 0 | 0.001 | 0.154 | 0 | 0.024 |
| 5.17000000000008e-21 | 0 | 0.001 | 0.154 | 0 | 0.024 |
| 5.17500000000009e-21 | 0 | 0.001 | 0.153 | 0 | 0.024 |
| 5.18000000000008e-21 | 0 | 0.001 | 0.153 | 0 | 0.023 |
| 5.18500000000009e-21 | 0 | 0.001 | 0.153 | 0 | 0.023 |
| 5.19000000000009e-21 | 0 | 0.001 | 0.153 | 0 | 0.023 |
| 5.19500000000009e-21 | 0 | 0.001 | 0.152 | 0 | 0.023 |
| 5.20000000000009e-21 | 0 | 0.001 | 0.152 | 0 | 0.023 |
| 5.20500000000009e-21 | 0 | 0.001 | 0.152 | 0 | 0.023 |
| 5.21000000000009e-21 | 0 | 0.001 | 0.152 | 0 | 0.023 |
| 5.21500000000009e-21 | 0 | 0.001 | 0.151 | 0 | 0.023 |
| 5.22000000000009e-21 | 0 | 0.001 | 0.151 | 0 | 0.023 |
| 5.22500000000009e-21 | 0 | 0.001 | 0.151 | 0 | 0.023 |
| 5.23000000000009e-21 | 0 | 0.001 | 0.15 | 0 | 0.023 |
| 5.23500000000009e-21 | 0 | 0.001 | 0.15 | 0 | 0.023 |
| 5.24000000000009e-21 | 0 | 0.001 | 0.15 | 0 | 0.022 |
| 5.24500000000009e-21 | 0 | 0.001 | 0.15 | 0 | 0.022 |
| 5.25000000000009e-21 | 0 | 0 | 0.149 | 0 | 0.022 |
| 5.25500000000009e-21 | 0 | 0 | 0.149 | 0 | 0.022 |
| 5.26000000000009e-21 | 0 | 0 | 0.149 | 0 | 0.022 |
| 5.26500000000009e-21 | 0 | 0 | 0.149 | 0 | 0.022 |
| 5.27000000000009e-21 | 0 | 0 | 0.148 | 0 | 0.022 |
| 5.27500000000009e-21 | 0 | 0 | 0.148 | 0 | 0.022 |
| 5.28000000000009e-21 | 0 | 0 | 0.148 | 0 | 0.022 |
| 5.28500000000009e-21 | 0 | 0 | 0.147 | 0 | 0.022 |
| 5.29000000000009e-21 | 0 | 0 | 0.147 | 0 | 0.022 |
| 5.29500000000009e-21 | 0 | 0 | 0.147 | 0 | 0.022 |
| 5.30000000000009e-21 | 0 | 0 | 0.147 | 0 | 0.022 |
| 5.30500000000009e-21 | 0 | 0 | 0.146 | 0 | 0.021 |
| 5.31000000000009e-21 | 0 | 0 | 0.146 | 0 | 0.021 |
| 5.31500000000009e-21 | 0 | 0 | 0.146 | 0 | 0.021 |
| 5.32000000000009e-21 | 0 | 0 | 0.146 | 0 | 0.021 |
| 5.32500000000009e-21 | 0 | 0 | 0.145 | 0 | 0.021 |
| 5.33000000000009e-21 | 0 | 0 | 0.145 | 0 | 0.021 |
| 5.33500000000009e-21 | 0 | 0 | 0.145 | 0 | 0.021 |
| 5.34000000000009e-21 | 0 | 0 | 0.145 | 0 | 0.021 |
| 5.3450000000001e-21 | 0 | 0 | 0.144 | 0 | 0.021 |
| 5.3500000000001e-21 | 0 | 0 | 0.144 | 0 | 0.021 |
| 5.3550000000001e-21 | 0 | 0 | 0.144 | 0 | 0.021 |
| 5.3600000000001e-21 | 0 | 0 | 0.144 | 0 | 0.021 |
| 5.3650000000001e-21 | 0 | 0 | 0.143 | 0 | 0.021 |
| 5.3700000000001e-21 | 0 | 0 | 0.143 | 0 | 0.02 |
| 5.3750000000001e-21 | 0 | 0 | 0.143 | 0 | 0.02 |
| 5.3800000000001e-21 | 0 | 0 | 0.143 | 0 | 0.02 |
| 5.3850000000001e-21 | 0 | 0 | 0.142 | 0 | 0.02 |
| 5.3900000000001e-21 | 0 | 0 | 0.142 | 0 | 0.02 |
| 5.3950000000001e-21 | 0 | 0 | 0.142 | 0 | 0.02 |
| 5.4000000000001e-21 | 0 | 0 | 0.141 | 0 | 0.02 |
| 5.4050000000001e-21 | 0 | 0 | 0.141 | 0 | 0.02 |
| 5.4100000000001e-21 | 0 | 0 | 0.141 | 0 | 0.02 |
| 5.4150000000001e-21 | 0 | 0 | 0.141 | 0 | 0.02 |
| 5.4200000000001e-21 | 0 | 0 | 0.14 | 0 | 0.02 |
| 5.4250000000001e-21 | 0 | 0 | 0.14 | 0 | 0.02 |
| 5.4300000000001e-21 | 0 | 0 | 0.14 | 0 | 0.02 |
| 5.4350000000001e-21 | 0 | 0 | 0.14 | 0 | 0.02 |
| 5.4400000000001e-21 | 0 | 0 | 0.139 | 0 | 0.019 |
| 5.4450000000001e-21 | 0 | 0 | 0.139 | 0 | 0.019 |
| 5.4500000000001e-21 | 0 | 0 | 0.139 | 0 | 0.019 |
| 5.4550000000001e-21 | 0 | 0 | 0.139 | 0 | 0.019 |
| 5.4600000000001e-21 | 0 | 0 | 0.138 | 0 | 0.019 |
| 5.4650000000001e-21 | 0 | 0 | 0.138 | 0 | 0.019 |
| 5.4700000000001e-21 | 0 | 0 | 0.138 | 0 | 0.019 |
| 5.4750000000001e-21 | 0 | 0 | 0.138 | 0 | 0.019 |
| 5.4800000000001e-21 | 0 | 0 | 0.137 | 0 | 0.019 |
| 5.4850000000001e-21 | 0 | 0 | 0.137 | 0 | 0.019 |
| 5.4900000000001e-21 | 0 | 0 | 0.137 | 0 | 0.019 |
| 5.4950000000001e-21 | 0 | 0 | 0.137 | 0 | 0.019 |
| 5.50000000000011e-21 | 0 | 0 | 0.136 | 0 | 0.019 |
| 5.50500000000011e-21 | 0 | 0 | 0.136 | 0 | 0.019 |
| 5.51000000000011e-21 | 0 | 0 | 0.136 | 0 | 0.018 |
| 5.51500000000011e-21 | 0 | 0 | 0.136 | 0 | 0.018 |
| 5.52000000000011e-21 | 0 | 0 | 0.135 | 0 | 0.018 |
| 5.52500000000011e-21 | 0 | 0 | 0.135 | 0 | 0.018 |
| 5.53000000000011e-21 | 0 | 0 | 0.135 | 0 | 0.018 |
| 5.53500000000011e-21 | 0 | 0 | 0.135 | 0 | 0.018 |
| 5.54000000000011e-21 | 0 | 0 | 0.134 | 0 | 0.018 |
| 5.54500000000011e-21 | 0 | 0 | 0.134 | 0 | 0.018 |
| 5.55000000000011e-21 | 0 | 0 | 0.134 | 0 | 0.018 |
| 5.55500000000011e-21 | 0 | 0 | 0.134 | 0 | 0.018 |
| 5.56000000000011e-21 | 0 | 0 | 0.134 | 0 | 0.018 |
| 5.56500000000011e-21 | 0 | 0 | 0.133 | 0 | 0.018 |
| 5.57000000000011e-21 | 0 | 0 | 0.133 | 0 | 0.018 |
| 5.57500000000011e-21 | 0 | 0 | 0.133 | 0 | 0.018 |
| 5.58000000000011e-21 | 0 | 0 | 0.133 | 0 | 0.018 |
| 5.58500000000011e-21 | 0 | 0 | 0.132 | 0 | 0.018 |
| 5.59000000000011e-21 | 0 | 0 | 0.132 | 0 | 0.017 |
| 5.59500000000011e-21 | 0 | 0 | 0.132 | 0 | 0.017 |
| 5.60000000000011e-21 | 0 | 0 | 0.132 | 0 | 0.017 |
| 5.60500000000011e-21 | 0 | 0 | 0.131 | 0 | 0.017 |
| 5.61000000000011e-21 | 0 | 0 | 0.131 | 0 | 0.017 |
| 5.61500000000011e-21 | 0 | 0 | 0.131 | 0 | 0.017 |
| 5.62000000000011e-21 | 0 | 0 | 0.131 | 0 | 0.017 |
| 5.62500000000011e-21 | 0 | 0 | 0.13 | 0 | 0.017 |
| 5.63000000000011e-21 | 0 | 0 | 0.13 | 0 | 0.017 |
| 5.63500000000011e-21 | 0 | 0 | 0.13 | 0 | 0.017 |
| 5.64000000000011e-21 | 0 | 0 | 0.13 | 0 | 0.017 |
| 5.64500000000011e-21 | 0 | 0 | 0.129 | 0 | 0.017 |
| 5.65000000000011e-21 | 0 | 0 | 0.129 | 0 | 0.017 |
| 5.65500000000011e-21 | 0 | 0 | 0.129 | 0 | 0.017 |
| 5.66000000000012e-21 | 0 | 0 | 0.129 | 0 | 0.017 |
| 5.66500000000012e-21 | 0 | 0 | 0.129 | 0 | 0.017 |
| 5.67000000000012e-21 | 0 | 0 | 0.128 | 0 | 0.016 |
| 5.67500000000012e-21 | 0 | 0 | 0.128 | 0 | 0.016 |
| 5.68000000000012e-21 | 0 | 0 | 0.128 | 0 | 0.016 |
| 5.68500000000012e-21 | 0 | 0 | 0.128 | 0 | 0.016 |
| 5.69000000000012e-21 | 0 | 0 | 0.127 | 0 | 0.016 |
| 5.69500000000012e-21 | 0 | 0 | 0.127 | 0 | 0.016 |
| 5.70000000000012e-21 | 0 | 0 | 0.127 | 0 | 0.016 |
| 5.70500000000012e-21 | 0 | 0 | 0.127 | 0 | 0.016 |
| 5.71000000000012e-21 | 0 | 0 | 0.126 | 0 | 0.016 |
| 5.71500000000012e-21 | 0 | 0 | 0.126 | 0 | 0.016 |
| 5.72000000000012e-21 | 0 | 0 | 0.126 | 0 | 0.016 |
| 5.72500000000012e-21 | 0 | 0 | 0.126 | 0 | 0.016 |
| 5.73000000000012e-21 | 0 | 0 | 0.126 | 0 | 0.016 |
| 5.73500000000012e-21 | 0 | 0 | 0.125 | 0 | 0.016 |
| 5.74000000000012e-21 | 0 | 0 | 0.125 | 0 | 0.016 |
| 5.74500000000012e-21 | 0 | 0 | 0.125 | 0 | 0.016 |
| 5.75000000000012e-21 | 0 | 0 | 0.125 | 0 | 0.016 |
| 5.75500000000012e-21 | 0 | 0 | 0.124 | 0 | 0.015 |
| 5.76000000000012e-21 | 0 | 0 | 0.124 | 0 | 0.015 |
| 5.76500000000012e-21 | 0 | 0 | 0.124 | 0 | 0.015 |
| 5.77000000000012e-21 | 0 | 0 | 0.124 | 0 | 0.015 |
| 5.77500000000012e-21 | 0 | 0 | 0.124 | 0 | 0.015 |
| 5.78000000000012e-21 | 0 | 0 | 0.123 | 0 | 0.015 |
| 5.78500000000012e-21 | 0 | 0 | 0.123 | 0 | 0.015 |
| 5.79000000000012e-21 | 0 | 0 | 0.123 | 0 | 0.015 |
| 5.79500000000012e-21 | 0 | 0 | 0.123 | 0 | 0.015 |
| 5.80000000000012e-21 | 0 | 0 | 0.122 | 0 | 0.015 |
| 5.80500000000012e-21 | 0 | 0 | 0.122 | 0 | 0.015 |
| 5.81000000000012e-21 | 0 | 0 | 0.122 | 0 | 0.015 |
| 5.81500000000013e-21 | 0 | 0 | 0.122 | 0 | 0.015 |
| 5.82000000000013e-21 | 0 | 0 | 0.122 | 0 | 0.015 |
| 5.82500000000013e-21 | 0 | 0 | 0.121 | 0 | 0.015 |
| 5.83000000000013e-21 | 0 | 0 | 0.121 | 0 | 0.015 |
| 5.83500000000013e-21 | 0 | 0 | 0.121 | 0 | 0.015 |
| 5.84000000000013e-21 | 0 | 0 | 0.121 | 0 | 0.015 |
| 5.84500000000013e-21 | 0 | 0 | 0.12 | 0 | 0.015 |
| 5.85000000000013e-21 | 0 | 0 | 0.12 | 0 | 0.014 |
| 5.85500000000013e-21 | 0 | 0 | 0.12 | 0 | 0.014 |
| 5.86000000000013e-21 | 0 | 0 | 0.12 | 0 | 0.014 |
| 5.86500000000013e-21 | 0 | 0 | 0.12 | 0 | 0.014 |
| 5.87000000000013e-21 | 0 | 0 | 0.119 | 0 | 0.014 |
| 5.87500000000013e-21 | 0 | 0 | 0.119 | 0 | 0.014 |
| 5.88000000000013e-21 | 0 | 0 | 0.119 | 0 | 0.014 |
| 5.88500000000013e-21 | 0 | 0 | 0.119 | 0 | 0.014 |
| 5.89000000000013e-21 | 0 | 0 | 0.118 | 0 | 0.014 |
| 5.89500000000013e-21 | 0 | 0 | 0.118 | 0 | 0.014 |
| 5.90000000000013e-21 | 0 | 0 | 0.118 | 0 | 0.014 |
| 5.90500000000013e-21 | 0 | 0 | 0.118 | 0 | 0.014 |
| 5.91000000000013e-21 | 0 | 0 | 0.118 | 0 | 0.014 |
| 5.91500000000013e-21 | 0 | 0 | 0.117 | 0 | 0.014 |
| 5.92000000000013e-21 | 0 | 0 | 0.117 | 0 | 0.014 |
| 5.92500000000013e-21 | 0 | 0 | 0.117 | 0 | 0.014 |
| 5.93000000000013e-21 | 0 | 0 | 0.117 | 0 | 0.014 |
| 5.93500000000013e-21 | 0 | 0 | 0.117 | 0 | 0.014 |
| 5.94000000000013e-21 | 0 | 0 | 0.116 | 0 | 0.014 |
| 5.94500000000013e-21 | 0 | 0 | 0.116 | 0 | 0.013 |
| 5.95000000000013e-21 | 0 | 0 | 0.116 | 0 | 0.013 |
| 5.95500000000013e-21 | 0 | 0 | 0.116 | 0 | 0.013 |
| 5.96000000000013e-21 | 0 | 0 | 0.116 | 0 | 0.013 |
| 5.96500000000013e-21 | 0 | 0 | 0.115 | 0 | 0.013 |
| 5.97000000000013e-21 | 0 | 0 | 0.115 | 0 | 0.013 |
| 5.97500000000014e-21 | 0 | 0 | 0.115 | 0 | 0.013 |
| 5.98000000000014e-21 | 0 | 0 | 0.115 | 0 | 0.013 |
| 5.98500000000014e-21 | 0 | 0 | 0.114 | 0 | 0.013 |
| 5.99000000000014e-21 | 0 | 0 | 0.114 | 0 | 0.013 |
| 5.99500000000014e-21 | 0 | 0 | 0.114 | 0 | 0.013 |
| 6.00000000000014e-21 | 0 | 0 | 0.114 | 0 | 0.013 |
| 6.00500000000014e-21 | 0 | 0 | 0.114 | 0 | 0.013 |
| 6.01000000000014e-21 | 0 | 0 | 0.113 | 0 | 0.013 |
| 6.01500000000014e-21 | 0 | 0 | 0.113 | 0 | 0.013 |
| 6.02000000000014e-21 | 0 | 0 | 0.113 | 0 | 0.013 |
| 6.02500000000014e-21 | 0 | 0 | 0.113 | 0 | 0.013 |
| 6.03000000000014e-21 | 0 | 0 | 0.113 | 0 | 0.013 |
| 6.03500000000014e-21 | 0 | 0 | 0.112 | 0 | 0.013 |
| 6.04000000000014e-21 | 0 | 0 | 0.112 | 0 | 0.013 |
| 6.04500000000014e-21 | 0 | 0 | 0.112 | 0 | 0.013 |
| 6.05000000000014e-21 | 0 | 0 | 0.112 | 0 | 0.013 |
| 6.05500000000014e-21 | 0 | 0 | 0.112 | 0 | 0.012 |
| 6.06000000000014e-21 | 0 | 0 | 0.111 | 0 | 0.012 |
| 6.06500000000014e-21 | 0 | 0 | 0.111 | 0 | 0.012 |
| 6.07000000000014e-21 | 0 | 0 | 0.111 | 0 | 0.012 |
| 6.07500000000014e-21 | 0 | 0 | 0.111 | 0 | 0.012 |
| 6.08000000000014e-21 | 0 | 0 | 0.111 | 0 | 0.012 |
| 6.08500000000014e-21 | 0 | 0 | 0.11 | 0 | 0.012 |
| 6.09000000000014e-21 | 0 | 0 | 0.11 | 0 | 0.012 |
| 6.09500000000014e-21 | 0 | 0 | 0.11 | 0 | 0.012 |
| 6.10000000000014e-21 | 0 | 0 | 0.11 | 0 | 0.012 |
| 6.10500000000014e-21 | 0 | 0 | 0.11 | 0 | 0.012 |
| 6.11000000000014e-21 | 0 | 0 | 0.109 | 0 | 0.012 |
| 6.11500000000014e-21 | 0 | 0 | 0.109 | 0 | 0.012 |
| 6.12000000000014e-21 | 0 | 0 | 0.109 | 0 | 0.012 |
| 6.12500000000014e-21 | 0 | 0 | 0.109 | 0 | 0.012 |
| 6.13000000000015e-21 | 0 | 0 | 0.109 | 0 | 0.012 |
| 6.13500000000015e-21 | 0 | 0 | 0.108 | 0 | 0.012 |
| 6.14000000000015e-21 | 0 | 0 | 0.108 | 0 | 0.012 |
| 6.14500000000015e-21 | 0 | 0 | 0.108 | 0 | 0.012 |
| 6.15000000000015e-21 | 0 | 0 | 0.108 | 0 | 0.012 |
| 6.15500000000015e-21 | 0 | 0 | 0.108 | 0 | 0.012 |
| 6.16000000000015e-21 | 0 | 0 | 0.107 | 0 | 0.012 |
| 6.16500000000015e-21 | 0 | 0 | 0.107 | 0 | 0.012 |
| 6.17000000000015e-21 | 0 | 0 | 0.107 | 0 | 0.011 |
| 6.17500000000015e-21 | 0 | 0 | 0.107 | 0 | 0.011 |
| 6.18000000000015e-21 | 0 | 0 | 0.107 | 0 | 0.011 |
| 6.18500000000015e-21 | 0 | 0 | 0.106 | 0 | 0.011 |
| 6.19000000000015e-21 | 0 | 0 | 0.106 | 0 | 0.011 |
| 6.19500000000015e-21 | 0 | 0 | 0.106 | 0 | 0.011 |
| 6.20000000000015e-21 | 0 | 0 | 0.106 | 0 | 0.011 |
| 6.20500000000015e-21 | 0 | 0 | 0.106 | 0 | 0.011 |
| 6.21000000000015e-21 | 0 | 0 | 0.106 | 0 | 0.011 |
| 6.21500000000015e-21 | 0 | 0 | 0.105 | 0 | 0.011 |
| 6.22000000000015e-21 | 0 | 0 | 0.105 | 0 | 0.011 |
| 6.22500000000015e-21 | 0 | 0 | 0.105 | 0 | 0.011 |
| 6.23000000000015e-21 | 0 | 0 | 0.105 | 0 | 0.011 |
| 6.23500000000015e-21 | 0 | 0 | 0.105 | 0 | 0.011 |
| 6.24000000000015e-21 | 0 | 0 | 0.104 | 0 | 0.011 |
| 6.24500000000015e-21 | 0 | 0 | 0.104 | 0 | 0.011 |
| 6.25000000000015e-21 | 0 | 0 | 0.104 | 0 | 0.011 |
| 6.25500000000015e-21 | 0 | 0 | 0.104 | 0 | 0.011 |
| 6.26000000000015e-21 | 0 | 0 | 0.104 | 0 | 0.011 |
| 6.26500000000015e-21 | 0 | 0 | 0.103 | 0 | 0.011 |
| 6.27000000000015e-21 | 0 | 0 | 0.103 | 0 | 0.011 |
| 6.27500000000015e-21 | 0 | 0 | 0.103 | 0 | 0.011 |
| 6.28000000000015e-21 | 0 | 0 | 0.103 | 0 | 0.011 |
| 6.28500000000015e-21 | 0 | 0 | 0.103 | 0 | 0.011 |
| 6.29000000000016e-21 | 0 | 0 | 0.102 | 0 | 0.011 |
| 6.29500000000016e-21 | 0 | 0 | 0.102 | 0 | 0.01 |
| 6.30000000000016e-21 | 0 | 0 | 0.102 | 0 | 0.01 |
| 6.30500000000016e-21 | 0 | 0 | 0.102 | 0 | 0.01 |
| 6.31000000000016e-21 | 0 | 0 | 0.102 | 0 | 0.01 |
| 6.31500000000016e-21 | 0 | 0 | 0.102 | 0 | 0.01 |
| 6.32000000000016e-21 | 0 | 0 | 0.101 | 0 | 0.01 |
| 6.32500000000016e-21 | 0 | 0 | 0.101 | 0 | 0.01 |
| 6.33000000000016e-21 | 0 | 0 | 0.101 | 0 | 0.01 |
| 6.33500000000016e-21 | 0 | 0 | 0.101 | 0 | 0.01 |
| 6.34000000000016e-21 | 0 | 0 | 0.101 | 0 | 0.01 |
| 6.34500000000016e-21 | 0 | 0 | 0.1 | 0 | 0.01 |
| 6.35000000000016e-21 | 0 | 0 | 0.1 | 0 | 0.01 |
| 6.35500000000016e-21 | 0 | 0 | 0.1 | 0 | 0.01 |
| 6.36000000000016e-21 | 0 | 0 | 0.1 | 0 | 0.01 |
| 6.36500000000016e-21 | 0 | 0 | 0.1 | 0 | 0.01 |
| 6.37000000000016e-21 | 0 | 0 | 0.1 | 0 | 0.01 |
| 6.37500000000016e-21 | 0 | 0 | 0.099 | 0 | 0.01 |
| 6.38000000000016e-21 | 0 | 0 | 0.099 | 0 | 0.01 |
| 6.38500000000016e-21 | 0 | 0 | 0.099 | 0 | 0.01 |
| 6.39000000000016e-21 | 0 | 0 | 0.099 | 0 | 0.01 |
| 6.39500000000016e-21 | 0 | 0 | 0.099 | 0 | 0.01 |
| 6.40000000000016e-21 | 0 | 0 | 0.098 | 0 | 0.01 |
| 6.40500000000016e-21 | 0 | 0 | 0.098 | 0 | 0.01 |
| 6.41000000000016e-21 | 0 | 0 | 0.098 | 0 | 0.01 |
| 6.41500000000016e-21 | 0 | 0 | 0.098 | 0 | 0.01 |
| 6.42000000000016e-21 | 0 | 0 | 0.098 | 0 | 0.01 |
| 6.42500000000016e-21 | 0 | 0 | 0.098 | 0 | 0.01 |
| 6.43000000000016e-21 | 0 | 0 | 0.097 | 0 | 0.009 |
| 6.43500000000016e-21 | 0 | 0 | 0.097 | 0 | 0.009 |
| 6.44000000000016e-21 | 0 | 0 | 0.097 | 0 | 0.009 |
| 6.44500000000017e-21 | 0 | 0 | 0.097 | 0 | 0.009 |
| 6.45000000000017e-21 | 0 | 0 | 0.097 | 0 | 0.009 |
| 6.45500000000017e-21 | 0 | 0 | 0.097 | 0 | 0.009 |
| 6.46000000000017e-21 | 0 | 0 | 0.096 | 0 | 0.009 |
| 6.46500000000017e-21 | 0 | 0 | 0.096 | 0 | 0.009 |
| 6.47000000000017e-21 | 0 | 0 | 0.096 | 0 | 0.009 |
| 6.47500000000017e-21 | 0 | 0 | 0.096 | 0 | 0.009 |
| 6.48000000000017e-21 | 0 | 0 | 0.096 | 0 | 0.009 |
| 6.48500000000017e-21 | 0 | 0 | 0.096 | 0 | 0.009 |
| 6.49000000000017e-21 | 0 | 0 | 0.095 | 0 | 0.009 |
| 6.49500000000017e-21 | 0 | 0 | 0.095 | 0 | 0.009 |
| 6.50000000000017e-21 | 0 | 0 | 0.095 | 0 | 0.009 |
| 6.50500000000017e-21 | 0 | 0 | 0.095 | 0 | 0.009 |
| 6.51000000000017e-21 | 0 | 0 | 0.095 | 0 | 0.009 |
| 6.51500000000017e-21 | 0 | 0 | 0.094 | 0 | 0.009 |
| 6.52000000000017e-21 | 0 | 0 | 0.094 | 0 | 0.009 |
| 6.52500000000017e-21 | 0 | 0 | 0.094 | 0 | 0.009 |
| 6.53000000000017e-21 | 0 | 0 | 0.094 | 0 | 0.009 |
| 6.53500000000017e-21 | 0 | 0 | 0.094 | 0 | 0.009 |
| 6.54000000000017e-21 | 0 | 0 | 0.094 | 0 | 0.009 |
| 6.54500000000017e-21 | 0 | 0 | 0.093 | 0 | 0.009 |
| 6.55000000000017e-21 | 0 | 0 | 0.093 | 0 | 0.009 |
| 6.55500000000017e-21 | 0 | 0 | 0.093 | 0 | 0.009 |
| 6.56000000000017e-21 | 0 | 0 | 0.093 | 0 | 0.009 |
| 6.56500000000017e-21 | 0 | 0 | 0.093 | 0 | 0.009 |
| 6.57000000000017e-21 | 0 | 0 | 0.093 | 0 | 0.009 |
| 6.57500000000017e-21 | 0 | 0 | 0.092 | 0 | 0.009 |
| 6.58000000000017e-21 | 0 | 0 | 0.092 | 0 | 0.009 |
| 6.58500000000017e-21 | 0 | 0 | 0.092 | 0 | 0.008 |
| 6.59000000000017e-21 | 0 | 0 | 0.092 | 0 | 0.008 |
| 6.59500000000017e-21 | 0 | 0 | 0.092 | 0 | 0.008 |
| 6.60000000000017e-21 | 0 | 0 | 0.092 | 0 | 0.008 |
| 6.60500000000018e-21 | 0 | 0 | 0.091 | 0 | 0.008 |
| 6.61000000000018e-21 | 0 | 0 | 0.091 | 0 | 0.008 |
| 6.61500000000018e-21 | 0 | 0 | 0.091 | 0 | 0.008 |
| 6.62000000000018e-21 | 0 | 0 | 0.091 | 0 | 0.008 |
| 6.62500000000018e-21 | 0 | 0 | 0.091 | 0 | 0.008 |
| 6.63000000000018e-21 | 0 | 0 | 0.091 | 0 | 0.008 |
| 6.63500000000018e-21 | 0 | 0 | 0.09 | 0 | 0.008 |
| 6.64000000000018e-21 | 0 | 0 | 0.09 | 0 | 0.008 |
| 6.64500000000018e-21 | 0 | 0 | 0.09 | 0 | 0.008 |
| 6.65000000000018e-21 | 0 | 0 | 0.09 | 0 | 0.008 |
| 6.65500000000018e-21 | 0 | 0 | 0.09 | 0 | 0.008 |
| 6.66000000000018e-21 | 0 | 0 | 0.09 | 0 | 0.008 |
| 6.66500000000018e-21 | 0 | 0 | 0.089 | 0 | 0.008 |
| 6.67000000000018e-21 | 0 | 0 | 0.089 | 0 | 0.008 |
| 6.67500000000018e-21 | 0 | 0 | 0.089 | 0 | 0.008 |
| 6.68000000000018e-21 | 0 | 0 | 0.089 | 0 | 0.008 |
| 6.68500000000018e-21 | 0 | 0 | 0.089 | 0 | 0.008 |
| 6.69000000000018e-21 | 0 | 0 | 0.089 | 0 | 0.008 |
| 6.69500000000018e-21 | 0 | 0 | 0.089 | 0 | 0.008 |
| 6.70000000000018e-21 | 0 | 0 | 0.088 | 0 | 0.008 |
| 6.70500000000018e-21 | 0 | 0 | 0.088 | 0 | 0.008 |
| 6.71000000000018e-21 | 0 | 0 | 0.088 | 0 | 0.008 |
| 6.71500000000018e-21 | 0 | 0 | 0.088 | 0 | 0.008 |
| 6.72000000000018e-21 | 0 | 0 | 0.088 | 0 | 0.008 |
| 6.72500000000018e-21 | 0 | 0 | 0.088 | 0 | 0.008 |
| 6.73000000000018e-21 | 0 | 0 | 0.087 | 0 | 0.008 |
| 6.73500000000018e-21 | 0 | 0 | 0.087 | 0 | 0.008 |
| 6.74000000000018e-21 | 0 | 0 | 0.087 | 0 | 0.008 |
| 6.74500000000018e-21 | 0 | 0 | 0.087 | 0 | 0.008 |
| 6.75000000000018e-21 | 0 | 0 | 0.087 | 0 | 0.008 |
| 6.75500000000018e-21 | 0 | 0 | 0.087 | 0 | 0.008 |
| 6.76000000000018e-21 | 0 | 0 | 0.086 | 0 | 0.007 |
| 6.76500000000019e-21 | 0 | 0 | 0.086 | 0 | 0.007 |
| 6.77000000000019e-21 | 0 | 0 | 0.086 | 0 | 0.007 |
| 6.77500000000019e-21 | 0 | 0 | 0.086 | 0 | 0.007 |
| 6.78000000000019e-21 | 0 | 0 | 0.086 | 0 | 0.007 |
| 6.78500000000019e-21 | 0 | 0 | 0.086 | 0 | 0.007 |
| 6.79000000000019e-21 | 0 | 0 | 0.086 | 0 | 0.007 |
| 6.79500000000018e-21 | 0 | 0 | 0.085 | 0 | 0.007 |
| 6.80000000000018e-21 | 0 | 0 | 0.085 | 0 | 0.007 |
| 6.80500000000018e-21 | 0 | 0 | 0.085 | 0 | 0.007 |
| 6.81000000000018e-21 | 0 | 0 | 0.085 | 0 | 0.007 |
| 6.81500000000018e-21 | 0 | 0 | 0.085 | 0 | 0.007 |
| 6.82000000000018e-21 | 0 | 0 | 0.085 | 0 | 0.007 |
| 6.82500000000018e-21 | 0 | 0 | 0.084 | 0 | 0.007 |
| 6.83000000000018e-21 | 0 | 0 | 0.084 | 0 | 0.007 |
| 6.83500000000018e-21 | 0 | 0 | 0.084 | 0 | 0.007 |
| 6.84000000000018e-21 | 0 | 0 | 0.084 | 0 | 0.007 |
| 6.84500000000018e-21 | 0 | 0 | 0.084 | 0 | 0.007 |
| 6.85000000000018e-21 | 0 | 0 | 0.084 | 0 | 0.007 |
| 6.85500000000018e-21 | 0 | 0 | 0.084 | 0 | 0.007 |
| 6.86000000000018e-21 | 0 | 0 | 0.083 | 0 | 0.007 |
| 6.86500000000018e-21 | 0 | 0 | 0.083 | 0 | 0.007 |
| 6.87000000000018e-21 | 0 | 0 | 0.083 | 0 | 0.007 |
| 6.87500000000018e-21 | 0 | 0 | 0.083 | 0 | 0.007 |
| 6.88000000000018e-21 | 0 | 0 | 0.083 | 0 | 0.007 |
| 6.88500000000018e-21 | 0 | 0 | 0.083 | 0 | 0.007 |
| 6.89000000000018e-21 | 0 | 0 | 0.082 | 0 | 0.007 |
| 6.89500000000018e-21 | 0 | 0 | 0.082 | 0 | 0.007 |
| 6.90000000000018e-21 | 0 | 0 | 0.082 | 0 | 0.007 |
| 6.90500000000018e-21 | 0 | 0 | 0.082 | 0 | 0.007 |
| 6.91000000000018e-21 | 0 | 0 | 0.082 | 0 | 0.007 |
| 6.91500000000017e-21 | 0 | 0 | 0.082 | 0 | 0.007 |
| 6.92000000000017e-21 | 0 | 0 | 0.082 | 0 | 0.007 |
| 6.92500000000017e-21 | 0 | 0 | 0.081 | 0 | 0.007 |
| 6.93000000000017e-21 | 0 | 0 | 0.081 | 0 | 0.007 |
| 6.93500000000017e-21 | 0 | 0 | 0.081 | 0 | 0.007 |
| 6.94000000000017e-21 | 0 | 0 | 0.081 | 0 | 0.007 |
| 6.94500000000017e-21 | 0 | 0 | 0.081 | 0 | 0.007 |
| 6.95000000000017e-21 | 0 | 0 | 0.081 | 0 | 0.007 |
| 6.95500000000017e-21 | 0 | 0 | 0.081 | 0 | 0.006 |
| 6.96000000000017e-21 | 0 | 0 | 0.08 | 0 | 0.006 |
| 6.96500000000017e-21 | 0 | 0 | 0.08 | 0 | 0.006 |
| 6.97000000000017e-21 | 0 | 0 | 0.08 | 0 | 0.006 |
| 6.97500000000017e-21 | 0 | 0 | 0.08 | 0 | 0.006 |
| 6.98000000000017e-21 | 0 | 0 | 0.08 | 0 | 0.006 |
| 6.98500000000017e-21 | 0 | 0 | 0.08 | 0 | 0.006 |
| 6.99000000000017e-21 | 0 | 0 | 0.08 | 0 | 0.006 |
| 6.99500000000017e-21 | 0 | 0 | 0.079 | 0 | 0.006 |
| 7.00000000000017e-21 | 0 | 0 | 0.079 | 0 | 0.006 |
| 7.00500000000017e-21 | 0 | 0 | 0.079 | 0 | 0.006 |
| 7.01000000000017e-21 | 0 | 0 | 0.079 | 0 | 0.006 |
| 7.01500000000017e-21 | 0 | 0 | 0.079 | 0 | 0.006 |
| 7.02000000000017e-21 | 0 | 0 | 0.079 | 0 | 0.006 |
| 7.02500000000016e-21 | 0 | 0 | 0.079 | 0 | 0.006 |
| 7.03000000000016e-21 | 0 | 0 | 0.078 | 0 | 0.006 |
| 7.03500000000016e-21 | 0 | 0 | 0.078 | 0 | 0.006 |
| 7.04000000000016e-21 | 0 | 0 | 0.078 | 0 | 0.006 |
| 7.04500000000016e-21 | 0 | 0 | 0.078 | 0 | 0.006 |
| 7.05000000000016e-21 | 0 | 0 | 0.078 | 0 | 0.006 |
| 7.05500000000016e-21 | 0 | 0 | 0.078 | 0 | 0.006 |
| 7.06000000000016e-21 | 0 | 0 | 0.078 | 0 | 0.006 |
| 7.06500000000016e-21 | 0 | 0 | 0.077 | 0 | 0.006 |
| 7.07000000000016e-21 | 0 | 0 | 0.077 | 0 | 0.006 |
| 7.07500000000016e-21 | 0 | 0 | 0.077 | 0 | 0.006 |
| 7.08000000000016e-21 | 0 | 0 | 0.077 | 0 | 0.006 |
| 7.08500000000016e-21 | 0 | 0 | 0.077 | 0 | 0.006 |
| 7.09000000000016e-21 | 0 | 0 | 0.077 | 0 | 0.006 |
| 7.09500000000016e-21 | 0 | 0 | 0.077 | 0 | 0.006 |
| 7.10000000000016e-21 | 0 | 0 | 0.076 | 0 | 0.006 |
| 7.10500000000016e-21 | 0 | 0 | 0.076 | 0 | 0.006 |
| 7.11000000000016e-21 | 0 | 0 | 0.076 | 0 | 0.006 |
| 7.11500000000016e-21 | 0 | 0 | 0.076 | 0 | 0.006 |
| 7.12000000000016e-21 | 0 | 0 | 0.076 | 0 | 0.006 |
| 7.12500000000016e-21 | 0 | 0 | 0.076 | 0 | 0.006 |
| 7.13000000000016e-21 | 0 | 0 | 0.076 | 0 | 0.006 |
| 7.13500000000016e-21 | 0 | 0 | 0.075 | 0 | 0.006 |
| 7.14000000000016e-21 | 0 | 0 | 0.075 | 0 | 0.006 |
| 7.14500000000015e-21 | 0 | 0 | 0.075 | 0 | 0.006 |
| 7.15000000000015e-21 | 0 | 0 | 0.075 | 0 | 0.006 |
| 7.15500000000015e-21 | 0 | 0 | 0.075 | 0 | 0.006 |
| 7.16000000000015e-21 | 0 | 0 | 0.075 | 0 | 0.006 |
| 7.16500000000015e-21 | 0 | 0 | 0.075 | 0 | 0.006 |
| 7.17000000000015e-21 | 0 | 0 | 0.075 | 0 | 0.006 |
| 7.17500000000015e-21 | 0 | 0 | 0.074 | 0 | 0.006 |
| 7.18000000000015e-21 | 0 | 0 | 0.074 | 0 | 0.006 |
| 7.18500000000015e-21 | 0 | 0 | 0.074 | 0 | 0.005 |
| 7.19000000000015e-21 | 0 | 0 | 0.074 | 0 | 0.005 |
| 7.19500000000015e-21 | 0 | 0 | 0.074 | 0 | 0.005 |
| 7.20000000000015e-21 | 0 | 0 | 0.074 | 0 | 0.005 |
| 7.20500000000015e-21 | 0 | 0 | 0.074 | 0 | 0.005 |
| 7.21000000000015e-21 | 0 | 0 | 0.073 | 0 | 0.005 |
| 7.21500000000015e-21 | 0 | 0 | 0.073 | 0 | 0.005 |
| 7.22000000000015e-21 | 0 | 0 | 0.073 | 0 | 0.005 |
| 7.22500000000015e-21 | 0 | 0 | 0.073 | 0 | 0.005 |
| 7.23000000000015e-21 | 0 | 0 | 0.073 | 0 | 0.005 |
| 7.23500000000015e-21 | 0 | 0 | 0.073 | 0 | 0.005 |
| 7.24000000000015e-21 | 0 | 0 | 0.073 | 0 | 0.005 |
| 7.24500000000015e-21 | 0 | 0 | 0.073 | 0 | 0.005 |
| 7.25000000000014e-21 | 0 | 0 | 0.072 | 0 | 0.005 |
| 7.25500000000014e-21 | 0 | 0 | 0.072 | 0 | 0.005 |
| 7.26000000000014e-21 | 0 | 0 | 0.072 | 0 | 0.005 |
| 7.26500000000014e-21 | 0 | 0 | 0.072 | 0 | 0.005 |
| 7.27000000000014e-21 | 0 | 0 | 0.072 | 0 | 0.005 |
| 7.27500000000014e-21 | 0 | 0 | 0.072 | 0 | 0.005 |
| 7.28000000000014e-21 | 0 | 0 | 0.072 | 0 | 0.005 |
| 7.28500000000014e-21 | 0 | 0 | 0.071 | 0 | 0.005 |
| 7.29000000000014e-21 | 0 | 0 | 0.071 | 0 | 0.005 |
| 7.29500000000014e-21 | 0 | 0 | 0.071 | 0 | 0.005 |
| 7.30000000000014e-21 | 0 | 0 | 0.071 | 0 | 0.005 |
| 7.30500000000014e-21 | 0 | 0 | 0.071 | 0 | 0.005 |
| 7.31000000000014e-21 | 0 | 0 | 0.071 | 0 | 0.005 |
| 7.31500000000014e-21 | 0 | 0 | 0.071 | 0 | 0.005 |
| 7.32000000000014e-21 | 0 | 0 | 0.071 | 0 | 0.005 |
| 7.32500000000014e-21 | 0 | 0 | 0.07 | 0 | 0.005 |
| 7.33000000000014e-21 | 0 | 0 | 0.07 | 0 | 0.005 |
| 7.33500000000014e-21 | 0 | 0 | 0.07 | 0 | 0.005 |
| 7.34000000000014e-21 | 0 | 0 | 0.07 | 0 | 0.005 |
| 7.34500000000014e-21 | 0 | 0 | 0.07 | 0 | 0.005 |
| 7.35000000000014e-21 | 0 | 0 | 0.07 | 0 | 0.005 |
| 7.35500000000014e-21 | 0 | 0 | 0.07 | 0 | 0.005 |
| 7.36000000000014e-21 | 0 | 0 | 0.07 | 0 | 0.005 |
| 7.36500000000014e-21 | 0 | 0 | 0.069 | 0 | 0.005 |
| 7.37000000000014e-21 | 0 | 0 | 0.069 | 0 | 0.005 |
| 7.37500000000013e-21 | 0 | 0 | 0.069 | 0 | 0.005 |
| 7.38000000000013e-21 | 0 | 0 | 0.069 | 0 | 0.005 |
| 7.38500000000013e-21 | 0 | 0 | 0.069 | 0 | 0.005 |
| 7.39000000000013e-21 | 0 | 0 | 0.069 | 0 | 0.005 |
| 7.39500000000013e-21 | 0 | 0 | 0.069 | 0 | 0.005 |
| 7.40000000000013e-21 | 0 | 0 | 0.069 | 0 | 0.005 |
| 7.40500000000013e-21 | 0 | 0 | 0.068 | 0 | 0.005 |
| 7.41000000000013e-21 | 0 | 0 | 0.068 | 0 | 0.005 |
| 7.41500000000013e-21 | 0 | 0 | 0.068 | 0 | 0.005 |
| 7.42000000000013e-21 | 0 | 0 | 0.068 | 0 | 0.005 |
| 7.42500000000013e-21 | 0 | 0 | 0.068 | 0 | 0.005 |
| 7.43000000000013e-21 | 0 | 0 | 0.068 | 0 | 0.005 |
| 7.43500000000013e-21 | 0 | 0 | 0.068 | 0 | 0.005 |
| 7.44000000000013e-21 | 0 | 0 | 0.068 | 0 | 0.005 |
| 7.44500000000013e-21 | 0 | 0 | 0.067 | 0 | 0.005 |
| 7.45000000000013e-21 | 0 | 0 | 0.067 | 0 | 0.005 |
| 7.45500000000013e-21 | 0 | 0 | 0.067 | 0 | 0.005 |
| 7.46000000000013e-21 | 0 | 0 | 0.067 | 0 | 0.005 |
| 7.46500000000013e-21 | 0 | 0 | 0.067 | 0 | 0.004 |
| 7.47000000000013e-21 | 0 | 0 | 0.067 | 0 | 0.004 |
| 7.47500000000013e-21 | 0 | 0 | 0.067 | 0 | 0.004 |
| 7.48000000000012e-21 | 0 | 0 | 0.067 | 0 | 0.004 |
| 7.48500000000012e-21 | 0 | 0 | 0.066 | 0 | 0.004 |
| 7.49000000000012e-21 | 0 | 0 | 0.066 | 0 | 0.004 |
| 7.49500000000012e-21 | 0 | 0 | 0.066 | 0 | 0.004 |
| 7.50000000000012e-21 | 0 | 0 | 0.066 | 0 | 0.004 |
| 7.50500000000012e-21 | 0 | 0 | 0.066 | 0 | 0.004 |
| 7.51000000000012e-21 | 0 | 0 | 0.066 | 0 | 0.004 |
| 7.51500000000012e-21 | 0 | 0 | 0.066 | 0 | 0.004 |
| 7.52000000000012e-21 | 0 | 0 | 0.066 | 0 | 0.004 |
| 7.52500000000012e-21 | 0 | 0 | 0.066 | 0 | 0.004 |
| 7.53000000000012e-21 | 0 | 0 | 0.065 | 0 | 0.004 |
| 7.53500000000012e-21 | 0 | 0 | 0.065 | 0 | 0.004 |
| 7.54000000000012e-21 | 0 | 0 | 0.065 | 0 | 0.004 |
| 7.54500000000012e-21 | 0 | 0 | 0.065 | 0 | 0.004 |
| 7.55000000000012e-21 | 0 | 0 | 0.065 | 0 | 0.004 |
| 7.55500000000012e-21 | 0 | 0 | 0.065 | 0 | 0.004 |
| 7.56000000000012e-21 | 0 | 0 | 0.065 | 0 | 0.004 |
| 7.56500000000012e-21 | 0 | 0 | 0.065 | 0 | 0.004 |
| 7.57000000000012e-21 | 0 | 0 | 0.064 | 0 | 0.004 |
| 7.57500000000012e-21 | 0 | 0 | 0.064 | 0 | 0.004 |
| 7.58000000000012e-21 | 0 | 0 | 0.064 | 0 | 0.004 |
| 7.58500000000012e-21 | 0 | 0 | 0.064 | 0 | 0.004 |
| 7.59000000000012e-21 | 0 | 0 | 0.064 | 0 | 0.004 |
| 7.59500000000012e-21 | 0 | 0 | 0.064 | 0 | 0.004 |
| 7.60000000000011e-21 | 0 | 0 | 0.064 | 0 | 0.004 |
| 7.60500000000011e-21 | 0 | 0 | 0.064 | 0 | 0.004 |
| 7.61000000000011e-21 | 0 | 0 | 0.064 | 0 | 0.004 |
| 7.61500000000011e-21 | 0 | 0 | 0.063 | 0 | 0.004 |
| 7.62000000000011e-21 | 0 | 0 | 0.063 | 0 | 0.004 |
| 7.62500000000011e-21 | 0 | 0 | 0.063 | 0 | 0.004 |
| 7.63000000000011e-21 | 0 | 0 | 0.063 | 0 | 0.004 |
| 7.63500000000011e-21 | 0 | 0 | 0.063 | 0 | 0.004 |
| 7.64000000000011e-21 | 0 | 0 | 0.063 | 0 | 0.004 |
| 7.64500000000011e-21 | 0 | 0 | 0.063 | 0 | 0.004 |
| 7.65000000000011e-21 | 0 | 0 | 0.063 | 0 | 0.004 |
| 7.65500000000011e-21 | 0 | 0 | 0.063 | 0 | 0.004 |
| 7.66000000000011e-21 | 0 | 0 | 0.062 | 0 | 0.004 |
| 7.66500000000011e-21 | 0 | 0 | 0.062 | 0 | 0.004 |
| 7.67000000000011e-21 | 0 | 0 | 0.062 | 0 | 0.004 |
| 7.67500000000011e-21 | 0 | 0 | 0.062 | 0 | 0.004 |
| 7.68000000000011e-21 | 0 | 0 | 0.062 | 0 | 0.004 |
| 7.68500000000011e-21 | 0 | 0 | 0.062 | 0 | 0.004 |
| 7.69000000000011e-21 | 0 | 0 | 0.062 | 0 | 0.004 |
| 7.69500000000011e-21 | 0 | 0 | 0.062 | 0 | 0.004 |
| 7.70000000000011e-21 | 0 | 0 | 0.062 | 0 | 0.004 |
| 7.70500000000011e-21 | 0 | 0 | 0.061 | 0 | 0.004 |
| 7.7100000000001e-21 | 0 | 0 | 0.061 | 0 | 0.004 |
| 7.7150000000001e-21 | 0 | 0 | 0.061 | 0 | 0.004 |
| 7.7200000000001e-21 | 0 | 0 | 0.061 | 0 | 0.004 |
| 7.7250000000001e-21 | 0 | 0 | 0.061 | 0 | 0.004 |
| 7.7300000000001e-21 | 0 | 0 | 0.061 | 0 | 0.004 |
| 7.7350000000001e-21 | 0 | 0 | 0.061 | 0 | 0.004 |
| 7.7400000000001e-21 | 0 | 0 | 0.061 | 0 | 0.004 |
| 7.7450000000001e-21 | 0 | 0 | 0.061 | 0 | 0.004 |
| 7.7500000000001e-21 | 0 | 0 | 0.06 | 0 | 0.004 |
| 7.7550000000001e-21 | 0 | 0 | 0.06 | 0 | 0.004 |
| 7.7600000000001e-21 | 0 | 0 | 0.06 | 0 | 0.004 |
| 7.7650000000001e-21 | 0 | 0 | 0.06 | 0 | 0.004 |
| 7.7700000000001e-21 | 0 | 0 | 0.06 | 0 | 0.004 |
| 7.7750000000001e-21 | 0 | 0 | 0.06 | 0 | 0.004 |
| 7.7800000000001e-21 | 0 | 0 | 0.06 | 0 | 0.004 |
| 7.7850000000001e-21 | 0 | 0 | 0.06 | 0 | 0.004 |
| 7.7900000000001e-21 | 0 | 0 | 0.06 | 0 | 0.004 |
| 7.7950000000001e-21 | 0 | 0 | 0.059 | 0 | 0.004 |
| 7.8000000000001e-21 | 0 | 0 | 0.059 | 0 | 0.004 |
| 7.8050000000001e-21 | 0 | 0 | 0.059 | 0 | 0.004 |
| 7.8100000000001e-21 | 0 | 0 | 0.059 | 0 | 0.003 |
| 7.8150000000001e-21 | 0 | 0 | 0.059 | 0 | 0.003 |
| 7.8200000000001e-21 | 0 | 0 | 0.059 | 0 | 0.003 |
| 7.8250000000001e-21 | 0 | 0 | 0.059 | 0 | 0.003 |
| 7.83000000000009e-21 | 0 | 0 | 0.059 | 0 | 0.003 |
| 7.83500000000009e-21 | 0 | 0 | 0.059 | 0 | 0.003 |
| 7.84000000000009e-21 | 0 | 0 | 0.058 | 0 | 0.003 |
| 7.84500000000009e-21 | 0 | 0 | 0.058 | 0 | 0.003 |
| 7.85000000000009e-21 | 0 | 0 | 0.058 | 0 | 0.003 |
| 7.85500000000009e-21 | 0 | 0 | 0.058 | 0 | 0.003 |
| 7.86000000000009e-21 | 0 | 0 | 0.058 | 0 | 0.003 |
| 7.86500000000009e-21 | 0 | 0 | 0.058 | 0 | 0.003 |
| 7.87000000000009e-21 | 0 | 0 | 0.058 | 0 | 0.003 |
| 7.87500000000009e-21 | 0 | 0 | 0.058 | 0 | 0.003 |
| 7.8800000000001e-21 | 0 | 0 | 0.058 | 0 | 0.003 |
| 7.88500000000009e-21 | 0 | 0 | 0.058 | 0 | 0.003 |
| 7.89000000000009e-21 | 0 | 0 | 0.057 | 0 | 0.003 |
| 7.89500000000009e-21 | 0 | 0 | 0.057 | 0 | 0.003 |
| 7.90000000000009e-21 | 0 | 0 | 0.057 | 0 | 0.003 |
| 7.90500000000009e-21 | 0 | 0 | 0.057 | 0 | 0.003 |
| 7.91000000000009e-21 | 0 | 0 | 0.057 | 0 | 0.003 |
| 7.91500000000009e-21 | 0 | 0 | 0.057 | 0 | 0.003 |
| 7.92000000000009e-21 | 0 | 0 | 0.057 | 0 | 0.003 |
| 7.92500000000009e-21 | 0 | 0 | 0.057 | 0 | 0.003 |
| 7.93000000000009e-21 | 0 | 0 | 0.057 | 0 | 0.003 |
| 7.93500000000009e-21 | 0 | 0 | 0.056 | 0 | 0.003 |
| 7.94000000000008e-21 | 0 | 0 | 0.056 | 0 | 0.003 |
| 7.94500000000008e-21 | 0 | 0 | 0.056 | 0 | 0.003 |
| 7.95000000000008e-21 | 0 | 0 | 0.056 | 0 | 0.003 |
| 7.95500000000008e-21 | 0 | 0 | 0.056 | 0 | 0.003 |
| 7.96000000000008e-21 | 0 | 0 | 0.056 | 0 | 0.003 |
| 7.96500000000008e-21 | 0 | 0 | 0.056 | 0 | 0.003 |
| 7.97000000000008e-21 | 0 | 0 | 0.056 | 0 | 0.003 |
| 7.97500000000008e-21 | 0 | 0 | 0.056 | 0 | 0.003 |
| 7.98000000000008e-21 | 0 | 0 | 0.056 | 0 | 0.003 |
| 7.98500000000008e-21 | 0 | 0 | 0.055 | 0 | 0.003 |
| 7.99000000000008e-21 | 0 | 0 | 0.055 | 0 | 0.003 |
| 7.99500000000008e-21 | 0 | 0 | 0.055 | 0 | 0.003 |
| 8.00000000000008e-21 | 0 | 0 | 0.055 | 0 | 0.003 |
| 8.00500000000008e-21 | 0 | 0 | 0.055 | 0 | 0.003 |
| 8.01000000000008e-21 | 0 | 0 | 0.055 | 0 | 0.003 |
| 8.01500000000008e-21 | 0 | 0 | 0.055 | 0 | 0.003 |
| 8.02000000000008e-21 | 0 | 0 | 0.055 | 0 | 0.003 |
| 8.02500000000008e-21 | 0 | 0 | 0.055 | 0 | 0.003 |
| 8.03000000000008e-21 | 0 | 0 | 0.055 | 0 | 0.003 |
| 8.03500000000008e-21 | 0 | 0 | 0.054 | 0 | 0.003 |
| 8.04000000000008e-21 | 0 | 0 | 0.054 | 0 | 0.003 |
| 8.04500000000008e-21 | 0 | 0 | 0.054 | 0 | 0.003 |
| 8.05000000000008e-21 | 0 | 0 | 0.054 | 0 | 0.003 |
| 8.05500000000007e-21 | 0 | 0 | 0.054 | 0 | 0.003 |
| 8.06000000000008e-21 | 0 | 0 | 0.054 | 0 | 0.003 |
| 8.06500000000007e-21 | 0 | 0 | 0.054 | 0 | 0.003 |
| 8.07000000000007e-21 | 0 | 0 | 0.054 | 0 | 0.003 |
| 8.07500000000007e-21 | 0 | 0 | 0.054 | 0 | 0.003 |
| 8.08000000000007e-21 | 0 | 0 | 0.054 | 0 | 0.003 |
| 8.08500000000007e-21 | 0 | 0 | 0.054 | 0 | 0.003 |
| 8.09000000000007e-21 | 0 | 0 | 0.053 | 0 | 0.003 |
| 8.09500000000007e-21 | 0 | 0 | 0.053 | 0 | 0.003 |
| 8.10000000000007e-21 | 0 | 0 | 0.053 | 0 | 0.003 |
| 8.10500000000007e-21 | 0 | 0 | 0.053 | 0 | 0.003 |
| 8.11000000000007e-21 | 0 | 0 | 0.053 | 0 | 0.003 |
| 8.11500000000007e-21 | 0 | 0 | 0.053 | 0 | 0.003 |
| 8.12000000000007e-21 | 0 | 0 | 0.053 | 0 | 0.003 |
| 8.12500000000007e-21 | 0 | 0 | 0.053 | 0 | 0.003 |
| 8.13000000000007e-21 | 0 | 0 | 0.053 | 0 | 0.003 |
| 8.13500000000007e-21 | 0 | 0 | 0.053 | 0 | 0.003 |
| 8.14000000000007e-21 | 0 | 0 | 0.052 | 0 | 0.003 |
| 8.14500000000007e-21 | 0 | 0 | 0.052 | 0 | 0.003 |
| 8.15000000000007e-21 | 0 | 0 | 0.052 | 0 | 0.003 |
| 8.15500000000007e-21 | 0 | 0 | 0.052 | 0 | 0.003 |
| 8.16000000000007e-21 | 0 | 0 | 0.052 | 0 | 0.003 |
| 8.16500000000006e-21 | 0 | 0 | 0.052 | 0 | 0.003 |
| 8.17000000000007e-21 | 0 | 0 | 0.052 | 0 | 0.003 |
| 8.17500000000006e-21 | 0 | 0 | 0.052 | 0 | 0.003 |
| 8.18000000000006e-21 | 0 | 0 | 0.052 | 0 | 0.003 |
| 8.18500000000006e-21 | 0 | 0 | 0.052 | 0 | 0.003 |
| 8.19000000000006e-21 | 0 | 0 | 0.052 | 0 | 0.003 |
| 8.19500000000006e-21 | 0 | 0 | 0.051 | 0 | 0.003 |
| 8.20000000000006e-21 | 0 | 0 | 0.051 | 0 | 0.003 |
| 8.20500000000006e-21 | 0 | 0 | 0.051 | 0 | 0.003 |
| 8.21000000000006e-21 | 0 | 0 | 0.051 | 0 | 0.003 |
| 8.21500000000006e-21 | 0 | 0 | 0.051 | 0 | 0.003 |
| 8.22000000000006e-21 | 0 | 0 | 0.051 | 0 | 0.003 |
| 8.22500000000006e-21 | 0 | 0 | 0.051 | 0 | 0.003 |
| 8.23000000000006e-21 | 0 | 0 | 0.051 | 0 | 0.003 |
| 8.23500000000006e-21 | 0 | 0 | 0.051 | 0 | 0.003 |
| 8.24000000000006e-21 | 0 | 0 | 0.051 | 0 | 0.003 |
| 8.24500000000006e-21 | 0 | 0 | 0.05 | 0 | 0.003 |
| 8.25000000000006e-21 | 0 | 0 | 0.05 | 0 | 0.003 |
| 8.25500000000006e-21 | 0 | 0 | 0.05 | 0 | 0.003 |
| 8.26000000000006e-21 | 0 | 0 | 0.05 | 0 | 0.003 |
| 8.26500000000006e-21 | 0 | 0 | 0.05 | 0 | 0.003 |
| 8.27000000000006e-21 | 0 | 0 | 0.05 | 0 | 0.003 |
| 8.27500000000006e-21 | 0 | 0 | 0.05 | 0 | 0.002 |
| 8.28000000000005e-21 | 0 | 0 | 0.05 | 0 | 0.002 |
| 8.28500000000006e-21 | 0 | 0 | 0.05 | 0 | 0.002 |
| 8.29000000000005e-21 | 0 | 0 | 0.05 | 0 | 0.002 |
| 8.29500000000005e-21 | 0 | 0 | 0.05 | 0 | 0.002 |
| 8.30000000000005e-21 | 0 | 0 | 0.049 | 0 | 0.002 |
| 8.30500000000005e-21 | 0 | 0 | 0.049 | 0 | 0.002 |
| 8.31000000000005e-21 | 0 | 0 | 0.049 | 0 | 0.002 |
| 8.31500000000005e-21 | 0 | 0 | 0.049 | 0 | 0.002 |
| 8.32000000000005e-21 | 0 | 0 | 0.049 | 0 | 0.002 |
| 8.32500000000005e-21 | 0 | 0 | 0.049 | 0 | 0.002 |
| 8.33000000000005e-21 | 0 | 0 | 0.049 | 0 | 0.002 |
| 8.33500000000005e-21 | 0 | 0 | 0.049 | 0 | 0.002 |
| 8.34000000000005e-21 | 0 | 0 | 0.049 | 0 | 0.002 |
| 8.34500000000005e-21 | 0 | 0 | 0.049 | 0 | 0.002 |
| 8.35000000000005e-21 | 0 | 0 | 0.049 | 0 | 0.002 |
| 8.35500000000005e-21 | 0 | 0 | 0.049 | 0 | 0.002 |
| 8.36000000000005e-21 | 0 | 0 | 0.048 | 0 | 0.002 |
| 8.36500000000005e-21 | 0 | 0 | 0.048 | 0 | 0.002 |
| 8.37000000000005e-21 | 0 | 0 | 0.048 | 0 | 0.002 |
| 8.37500000000005e-21 | 0 | 0 | 0.048 | 0 | 0.002 |
| 8.38000000000005e-21 | 0 | 0 | 0.048 | 0 | 0.002 |
| 8.38500000000005e-21 | 0 | 0 | 0.048 | 0 | 0.002 |
| 8.39000000000004e-21 | 0 | 0 | 0.048 | 0 | 0.002 |
| 8.39500000000005e-21 | 0 | 0 | 0.048 | 0 | 0.002 |
| 8.40000000000004e-21 | 0 | 0 | 0.048 | 0 | 0.002 |
| 8.40500000000004e-21 | 0 | 0 | 0.048 | 0 | 0.002 |
| 8.41000000000004e-21 | 0 | 0 | 0.048 | 0 | 0.002 |
| 8.41500000000004e-21 | 0 | 0 | 0.047 | 0 | 0.002 |
| 8.42000000000004e-21 | 0 | 0 | 0.047 | 0 | 0.002 |
| 8.42500000000004e-21 | 0 | 0 | 0.047 | 0 | 0.002 |
| 8.43000000000004e-21 | 0 | 0 | 0.047 | 0 | 0.002 |
| 8.43500000000004e-21 | 0 | 0 | 0.047 | 0 | 0.002 |
| 8.44000000000004e-21 | 0 | 0 | 0.047 | 0 | 0.002 |
| 8.44500000000004e-21 | 0 | 0 | 0.047 | 0 | 0.002 |
| 8.45000000000004e-21 | 0 | 0 | 0.047 | 0 | 0.002 |
| 8.45500000000004e-21 | 0 | 0 | 0.047 | 0 | 0.002 |
| 8.46000000000004e-21 | 0 | 0 | 0.047 | 0 | 0.002 |
| 8.46500000000004e-21 | 0 | 0 | 0.047 | 0 | 0.002 |
| 8.47000000000004e-21 | 0 | 0 | 0.047 | 0 | 0.002 |
| 8.47500000000004e-21 | 0 | 0 | 0.046 | 0 | 0.002 |
| 8.48000000000004e-21 | 0 | 0 | 0.046 | 0 | 0.002 |
| 8.48500000000004e-21 | 0 | 0 | 0.046 | 0 | 0.002 |
| 8.49000000000004e-21 | 0 | 0 | 0.046 | 0 | 0.002 |
| 8.49500000000004e-21 | 0 | 0 | 0.046 | 0 | 0.002 |
| 8.50000000000004e-21 | 0 | 0 | 0.046 | 0 | 0.002 |
| 8.50500000000004e-21 | 0 | 0 | 0.046 | 0 | 0.002 |
| 8.51000000000004e-21 | 0 | 0 | 0.046 | 0 | 0.002 |
| 8.51500000000003e-21 | 0 | 0 | 0.046 | 0 | 0.002 |
| 8.52000000000004e-21 | 0 | 0 | 0.046 | 0 | 0.002 |
| 8.52500000000003e-21 | 0 | 0 | 0.046 | 0 | 0.002 |
| 8.53000000000003e-21 | 0 | 0 | 0.046 | 0 | 0.002 |
| 8.53500000000003e-21 | 0 | 0 | 0.045 | 0 | 0.002 |
| 8.54000000000003e-21 | 0 | 0 | 0.045 | 0 | 0.002 |
| 8.54500000000003e-21 | 0 | 0 | 0.045 | 0 | 0.002 |
| 8.55000000000003e-21 | 0 | 0 | 0.045 | 0 | 0.002 |
| 8.55500000000003e-21 | 0 | 0 | 0.045 | 0 | 0.002 |
| 8.56000000000003e-21 | 0 | 0 | 0.045 | 0 | 0.002 |
| 8.56500000000003e-21 | 0 | 0 | 0.045 | 0 | 0.002 |
| 8.57000000000003e-21 | 0 | 0 | 0.045 | 0 | 0.002 |
| 8.57500000000003e-21 | 0 | 0 | 0.045 | 0 | 0.002 |
| 8.58000000000003e-21 | 0 | 0 | 0.045 | 0 | 0.002 |
| 8.58500000000003e-21 | 0 | 0 | 0.045 | 0 | 0.002 |
| 8.59000000000003e-21 | 0 | 0 | 0.045 | 0 | 0.002 |
| 8.59500000000003e-21 | 0 | 0 | 0.044 | 0 | 0.002 |
| 8.60000000000003e-21 | 0 | 0 | 0.044 | 0 | 0.002 |
| 8.60500000000003e-21 | 0 | 0 | 0.044 | 0 | 0.002 |
| 8.61000000000003e-21 | 0 | 0 | 0.044 | 0 | 0.002 |
| 8.61500000000003e-21 | 0 | 0 | 0.044 | 0 | 0.002 |
| 8.62000000000003e-21 | 0 | 0 | 0.044 | 0 | 0.002 |
| 8.62500000000002e-21 | 0 | 0 | 0.044 | 0 | 0.002 |
| 8.63000000000003e-21 | 0 | 0 | 0.044 | 0 | 0.002 |
| 8.63500000000002e-21 | 0 | 0 | 0.044 | 0 | 0.002 |
| 8.64000000000002e-21 | 0 | 0 | 0.044 | 0 | 0.002 |
| 8.64500000000002e-21 | 0 | 0 | 0.044 | 0 | 0.002 |
| 8.65000000000002e-21 | 0 | 0 | 0.044 | 0 | 0.002 |
| 8.65500000000002e-21 | 0 | 0 | 0.044 | 0 | 0.002 |
| 8.66000000000002e-21 | 0 | 0 | 0.043 | 0 | 0.002 |
| 8.66500000000002e-21 | 0 | 0 | 0.043 | 0 | 0.002 |
| 8.67000000000002e-21 | 0 | 0 | 0.043 | 0 | 0.002 |
| 8.67500000000002e-21 | 0 | 0 | 0.043 | 0 | 0.002 |
| 8.68000000000002e-21 | 0 | 0 | 0.043 | 0 | 0.002 |
| 8.68500000000002e-21 | 0 | 0 | 0.043 | 0 | 0.002 |
| 8.69000000000002e-21 | 0 | 0 | 0.043 | 0 | 0.002 |
| 8.69500000000002e-21 | 0 | 0 | 0.043 | 0 | 0.002 |
| 8.70000000000002e-21 | 0 | 0 | 0.043 | 0 | 0.002 |
| 8.70500000000002e-21 | 0 | 0 | 0.043 | 0 | 0.002 |
| 8.71000000000002e-21 | 0 | 0 | 0.043 | 0 | 0.002 |
| 8.71500000000002e-21 | 0 | 0 | 0.043 | 0 | 0.002 |
| 8.72000000000002e-21 | 0 | 0 | 0.043 | 0 | 0.002 |
| 8.72500000000002e-21 | 0 | 0 | 0.042 | 0 | 0.002 |
| 8.73000000000002e-21 | 0 | 0 | 0.042 | 0 | 0.002 |
| 8.73500000000002e-21 | 0 | 0 | 0.042 | 0 | 0.002 |
| 8.74000000000001e-21 | 0 | 0 | 0.042 | 0 | 0.002 |
| 8.74500000000002e-21 | 0 | 0 | 0.042 | 0 | 0.002 |
| 8.75000000000001e-21 | 0 | 0 | 0.042 | 0 | 0.002 |
| 8.75500000000001e-21 | 0 | 0 | 0.042 | 0 | 0.002 |
| 8.76000000000001e-21 | 0 | 0 | 0.042 | 0 | 0.002 |
| 8.76500000000001e-21 | 0 | 0 | 0.042 | 0 | 0.002 |
| 8.77000000000001e-21 | 0 | 0 | 0.042 | 0 | 0.002 |
| 8.77500000000001e-21 | 0 | 0 | 0.042 | 0 | 0.002 |
| 8.78000000000001e-21 | 0 | 0 | 0.042 | 0 | 0.002 |
| 8.78500000000001e-21 | 0 | 0 | 0.042 | 0 | 0.002 |
| 8.79000000000001e-21 | 0 | 0 | 0.041 | 0 | 0.002 |
| 8.79500000000001e-21 | 0 | 0 | 0.041 | 0 | 0.002 |
| 8.80000000000001e-21 | 0 | 0 | 0.041 | 0 | 0.002 |
| 8.80500000000001e-21 | 0 | 0 | 0.041 | 0 | 0.002 |
| 8.81000000000001e-21 | 0 | 0 | 0.041 | 0 | 0.002 |
| 8.81500000000001e-21 | 0 | 0 | 0.041 | 0 | 0.002 |
| 8.82000000000001e-21 | 0 | 0 | 0.041 | 0 | 0.002 |
| 8.82500000000001e-21 | 0 | 0 | 0.041 | 0 | 0.002 |
| 8.83000000000001e-21 | 0 | 0 | 0.041 | 0 | 0.002 |
| 8.83500000000001e-21 | 0 | 0 | 0.041 | 0 | 0.002 |
| 8.84000000000001e-21 | 0 | 0 | 0.041 | 0 | 0.002 |
| 8.84500000000001e-21 | 0 | 0 | 0.041 | 0 | 0.002 |
| 8.85e-21 | 0 | 0 | 0.041 | 0 | 0.002 |
| 8.85500000000001e-21 | 0 | 0 | 0.04 | 0 | 0.002 |
| 8.86e-21 | 0 | 0 | 0.04 | 0 | 0.002 |
| 8.865e-21 | 0 | 0 | 0.04 | 0 | 0.002 |
| 8.87e-21 | 0 | 0 | 0.04 | 0 | 0.002 |
| 8.875e-21 | 0 | 0 | 0.04 | 0 | 0.002 |
| 8.88e-21 | 0 | 0 | 0.04 | 0 | 0.002 |
| 8.885e-21 | 0 | 0 | 0.04 | 0 | 0.002 |
| 8.89e-21 | 0 | 0 | 0.04 | 0 | 0.002 |
| 8.895e-21 | 0 | 0 | 0.04 | 0 | 0.002 |
| 8.9e-21 | 0 | 0 | 0.04 | 0 | 0.002 |
| 8.905e-21 | 0 | 0 | 0.04 | 0 | 0.002 |
| 8.91e-21 | 0 | 0 | 0.04 | 0 | 0.002 |
| 8.915e-21 | 0 | 0 | 0.04 | 0 | 0.002 |
| 8.92e-21 | 0 | 0 | 0.04 | 0 | 0.002 |
| 8.925e-21 | 0 | 0 | 0.039 | 0 | 0.002 |
| 8.93e-21 | 0 | 0 | 0.039 | 0 | 0.002 |
| 8.935e-21 | 0 | 0 | 0.039 | 0 | 0.002 |
| 8.94e-21 | 0 | 0 | 0.039 | 0 | 0.002 |
| 8.945e-21 | 0 | 0 | 0.039 | 0 | 0.002 |
| 8.95e-21 | 0 | 0 | 0.039 | 0 | 0.002 |
| 8.955e-21 | 0 | 0 | 0.039 | 0 | 0.002 |
| 8.96e-21 | 0 | 0 | 0.039 | 0 | 0.002 |
| 8.965e-21 | 0 | 0 | 0.039 | 0 | 0.002 |
| 8.97e-21 | 0 | 0 | 0.039 | 0 | 0.002 |
| 8.97499999999999e-21 | 0 | 0 | 0.039 | 0 | 0.002 |
| 8.98e-21 | 0 | 0 | 0.039 | 0 | 0.001 |
| 8.98499999999999e-21 | 0 | 0 | 0.039 | 0 | 0.001 |
| 8.99e-21 | 0 | 0 | 0.039 | 0 | 0.001 |
| 8.99499999999999e-21 | 0 | 0 | 0.038 | 0 | 0.001 |
| 9e-21 | 0 | 0 | 0.038 | 0 | 0.001 |
| 9.005e-21 | 0 | 0 | 0.038 | 0 | 0.001 |
| 9.01e-21 | 0 | 0 | 0.038 | 0 | 0.001 |
| 9.015e-21 | 0 | 0 | 0.038 | 0 | 0.001 |
| 9.02e-21 | 0 | 0 | 0.038 | 0 | 0.001 |
| 9.02499999999999e-21 | 0 | 0 | 0.038 | 0 | 0.001 |
| 9.03e-21 | 0 | 0 | 0.038 | 0 | 0.001 |
| 9.03499999999999e-21 | 0 | 0 | 0.038 | 0 | 0.001 |
| 9.03999999999999e-21 | 0 | 0 | 0.038 | 0 | 0.001 |
| 9.04499999999999e-21 | 0 | 0 | 0.038 | 0 | 0.001 |
| 9.04999999999999e-21 | 0 | 0 | 0.038 | 0 | 0.001 |
| 9.05499999999999e-21 | 0 | 0 | 0.038 | 0 | 0.001 |
| 9.05999999999999e-21 | 0 | 0 | 0.038 | 0 | 0.001 |
| 9.06499999999999e-21 | 0 | 0 | 0.038 | 0 | 0.001 |
| 9.06999999999999e-21 | 0 | 0 | 0.037 | 0 | 0.001 |
| 9.07499999999999e-21 | 0 | 0 | 0.037 | 0 | 0.001 |
| 9.07999999999999e-21 | 0 | 0 | 0.037 | 0 | 0.001 |
| 9.08499999999998e-21 | 0 | 0 | 0.037 | 0 | 0.001 |
| 9.08999999999998e-21 | 0 | 0 | 0.037 | 0 | 0.001 |
| 9.09499999999998e-21 | 0 | 0 | 0.037 | 0 | 0.001 |
| 9.09999999999998e-21 | 0 | 0 | 0.037 | 0 | 0.001 |
| 9.10499999999998e-21 | 0 | 0 | 0.037 | 0 | 0.001 |
| 9.10999999999998e-21 | 0 | 0 | 0.037 | 0 | 0.001 |
| 9.11499999999998e-21 | 0 | 0 | 0.037 | 0 | 0.001 |
| 9.11999999999998e-21 | 0 | 0 | 0.037 | 0 | 0.001 |
| 9.12499999999998e-21 | 0 | 0 | 0.037 | 0 | 0.001 |
| 9.12999999999998e-21 | 0 | 0 | 0.037 | 0 | 0.001 |
| 9.13499999999998e-21 | 0 | 0 | 0.037 | 0 | 0.001 |
| 9.13999999999998e-21 | 0 | 0 | 0.037 | 0 | 0.001 |
| 9.14499999999998e-21 | 0 | 0 | 0.036 | 0 | 0.001 |
| 9.14999999999998e-21 | 0 | 0 | 0.036 | 0 | 0.001 |
| 9.15499999999998e-21 | 0 | 0 | 0.036 | 0 | 0.001 |
| 9.15999999999998e-21 | 0 | 0 | 0.036 | 0 | 0.001 |
| 9.16499999999998e-21 | 0 | 0 | 0.036 | 0 | 0.001 |
| 9.16999999999998e-21 | 0 | 0 | 0.036 | 0 | 0.001 |
| 9.17499999999998e-21 | 0 | 0 | 0.036 | 0 | 0.001 |
| 9.17999999999998e-21 | 0 | 0 | 0.036 | 0 | 0.001 |
| 9.18499999999998e-21 | 0 | 0 | 0.036 | 0 | 0.001 |
| 9.18999999999998e-21 | 0 | 0 | 0.036 | 0 | 0.001 |
| 9.19499999999998e-21 | 0 | 0 | 0.036 | 0 | 0.001 |
| 9.19999999999997e-21 | 0 | 0 | 0.036 | 0 | 0.001 |
| 9.20499999999998e-21 | 0 | 0 | 0.036 | 0 | 0.001 |
| 9.20999999999997e-21 | 0 | 0 | 0.036 | 0 | 0.001 |
| 9.21499999999997e-21 | 0 | 0 | 0.036 | 0 | 0.001 |
| 9.21999999999997e-21 | 0 | 0 | 0.035 | 0 | 0.001 |
| 9.22499999999997e-21 | 0 | 0 | 0.035 | 0 | 0.001 |
| 9.22999999999997e-21 | 0 | 0 | 0.035 | 0 | 0.001 |
| 9.23499999999997e-21 | 0 | 0 | 0.035 | 0 | 0.001 |
| 9.23999999999997e-21 | 0 | 0 | 0.035 | 0 | 0.001 |
| 9.24499999999997e-21 | 0 | 0 | 0.035 | 0 | 0.001 |
| 9.24999999999997e-21 | 0 | 0 | 0.035 | 0 | 0.001 |
| 9.25499999999997e-21 | 0 | 0 | 0.035 | 0 | 0.001 |
| 9.25999999999997e-21 | 0 | 0 | 0.035 | 0 | 0.001 |
| 9.26499999999997e-21 | 0 | 0 | 0.035 | 0 | 0.001 |
| 9.26999999999997e-21 | 0 | 0 | 0.035 | 0 | 0.001 |
| 9.27499999999997e-21 | 0 | 0 | 0.035 | 0 | 0.001 |
| 9.27999999999997e-21 | 0 | 0 | 0.035 | 0 | 0.001 |
| 9.28499999999997e-21 | 0 | 0 | 0.035 | 0 | 0.001 |
| 9.28999999999997e-21 | 0 | 0 | 0.035 | 0 | 0.001 |
| 9.29499999999997e-21 | 0 | 0 | 0.035 | 0 | 0.001 |
| 9.29999999999997e-21 | 0 | 0 | 0.034 | 0 | 0.001 |
| 9.30499999999997e-21 | 0 | 0 | 0.034 | 0 | 0.001 |
| 9.30999999999996e-21 | 0 | 0 | 0.034 | 0 | 0.001 |
| 9.31499999999997e-21 | 0 | 0 | 0.034 | 0 | 0.001 |
| 9.31999999999996e-21 | 0 | 0 | 0.034 | 0 | 0.001 |
| 9.32499999999996e-21 | 0 | 0 | 0.034 | 0 | 0.001 |
| 9.32999999999996e-21 | 0 | 0 | 0.034 | 0 | 0.001 |
| 9.33499999999996e-21 | 0 | 0 | 0.034 | 0 | 0.001 |
| 9.33999999999996e-21 | 0 | 0 | 0.034 | 0 | 0.001 |
| 9.34499999999996e-21 | 0 | 0 | 0.034 | 0 | 0.001 |
| 9.34999999999996e-21 | 0 | 0 | 0.034 | 0 | 0.001 |
| 9.35499999999996e-21 | 0 | 0 | 0.034 | 0 | 0.001 |
| 9.35999999999996e-21 | 0 | 0 | 0.034 | 0 | 0.001 |
| 9.36499999999996e-21 | 0 | 0 | 0.034 | 0 | 0.001 |
| 9.36999999999996e-21 | 0 | 0 | 0.034 | 0 | 0.001 |
| 9.37499999999996e-21 | 0 | 0 | 0.034 | 0 | 0.001 |
| 9.37999999999996e-21 | 0 | 0 | 0.033 | 0 | 0.001 |
| 9.38499999999996e-21 | 0 | 0 | 0.033 | 0 | 0.001 |
| 9.38999999999996e-21 | 0 | 0 | 0.033 | 0 | 0.001 |
| 9.39499999999996e-21 | 0 | 0 | 0.033 | 0 | 0.001 |
| 9.39999999999996e-21 | 0 | 0 | 0.033 | 0 | 0.001 |
| 9.40499999999996e-21 | 0 | 0 | 0.033 | 0 | 0.001 |
| 9.40999999999996e-21 | 0 | 0 | 0.033 | 0 | 0.001 |
| 9.41499999999996e-21 | 0 | 0 | 0.033 | 0 | 0.001 |
| 9.41999999999996e-21 | 0 | 0 | 0.033 | 0 | 0.001 |
| 9.42499999999995e-21 | 0 | 0 | 0.033 | 0 | 0.001 |
| 9.42999999999996e-21 | 0 | 0 | 0.033 | 0 | 0.001 |
| 9.43499999999995e-21 | 0 | 0 | 0.033 | 0 | 0.001 |
| 9.43999999999995e-21 | 0 | 0 | 0.033 | 0 | 0.001 |
| 9.44499999999995e-21 | 0 | 0 | 0.033 | 0 | 0.001 |
| 9.44999999999995e-21 | 0 | 0 | 0.033 | 0 | 0.001 |
| 9.45499999999995e-21 | 0 | 0 | 0.033 | 0 | 0.001 |
| 9.45999999999995e-21 | 0 | 0 | 0.033 | 0 | 0.001 |
| 9.46499999999995e-21 | 0 | 0 | 0.032 | 0 | 0.001 |
| 9.46999999999995e-21 | 0 | 0 | 0.032 | 0 | 0.001 |
| 9.47499999999995e-21 | 0 | 0 | 0.032 | 0 | 0.001 |
| 9.47999999999995e-21 | 0 | 0 | 0.032 | 0 | 0.001 |
| 9.48499999999995e-21 | 0 | 0 | 0.032 | 0 | 0.001 |
| 9.48999999999995e-21 | 0 | 0 | 0.032 | 0 | 0.001 |
| 9.49499999999995e-21 | 0 | 0 | 0.032 | 0 | 0.001 |
| 9.49999999999995e-21 | 0 | 0 | 0.032 | 0 | 0.001 |
| 9.50499999999995e-21 | 0 | 0 | 0.032 | 0 | 0.001 |
| 9.50999999999995e-21 | 0 | 0 | 0.032 | 0 | 0.001 |
| 9.51499999999995e-21 | 0 | 0 | 0.032 | 0 | 0.001 |
| 9.51999999999995e-21 | 0 | 0 | 0.032 | 0 | 0.001 |
| 9.52499999999995e-21 | 0 | 0 | 0.032 | 0 | 0.001 |
| 9.52999999999995e-21 | 0 | 0 | 0.032 | 0 | 0.001 |
| 9.53499999999995e-21 | 0 | 0 | 0.032 | 0 | 0.001 |
| 9.53999999999995e-21 | 0 | 0 | 0.032 | 0 | 0.001 |
| 9.54499999999994e-21 | 0 | 0 | 0.032 | 0 | 0.001 |
| 9.54999999999994e-21 | 0 | 0 | 0.031 | 0 | 0.001 |
| 9.55499999999994e-21 | 0 | 0 | 0.031 | 0 | 0.001 |
| 9.55999999999994e-21 | 0 | 0 | 0.031 | 0 | 0.001 |
| 9.56499999999994e-21 | 0 | 0 | 0.031 | 0 | 0.001 |
| 9.56999999999994e-21 | 0 | 0 | 0.031 | 0 | 0.001 |
| 9.57499999999994e-21 | 0 | 0 | 0.031 | 0 | 0.001 |
| 9.57999999999994e-21 | 0 | 0 | 0.031 | 0 | 0.001 |
| 9.58499999999994e-21 | 0 | 0 | 0.031 | 0 | 0.001 |
| 9.58999999999994e-21 | 0 | 0 | 0.031 | 0 | 0.001 |
| 9.59499999999994e-21 | 0 | 0 | 0.031 | 0 | 0.001 |
| 9.59999999999994e-21 | 0 | 0 | 0.031 | 0 | 0.001 |
| 9.60499999999994e-21 | 0 | 0 | 0.031 | 0 | 0.001 |
| 9.60999999999994e-21 | 0 | 0 | 0.031 | 0 | 0.001 |
| 9.61499999999994e-21 | 0 | 0 | 0.031 | 0 | 0.001 |
| 9.61999999999994e-21 | 0 | 0 | 0.031 | 0 | 0.001 |
| 9.62499999999994e-21 | 0 | 0 | 0.031 | 0 | 0.001 |
| 9.62999999999994e-21 | 0 | 0 | 0.031 | 0 | 0.001 |
| 9.63499999999994e-21 | 0 | 0 | 0.031 | 0 | 0.001 |
| 9.63999999999994e-21 | 0 | 0 | 0.03 | 0 | 0.001 |
| 9.64499999999994e-21 | 0 | 0 | 0.03 | 0 | 0.001 |
| 9.64999999999994e-21 | 0 | 0 | 0.03 | 0 | 0.001 |
| 9.65499999999994e-21 | 0 | 0 | 0.03 | 0 | 0.001 |
| 9.65999999999993e-21 | 0 | 0 | 0.03 | 0 | 0.001 |
| 9.66499999999994e-21 | 0 | 0 | 0.03 | 0 | 0.001 |
| 9.66999999999993e-21 | 0 | 0 | 0.03 | 0 | 0.001 |
| 9.67499999999993e-21 | 0 | 0 | 0.03 | 0 | 0.001 |
| 9.67999999999993e-21 | 0 | 0 | 0.03 | 0 | 0.001 |
| 9.68499999999993e-21 | 0 | 0 | 0.03 | 0 | 0.001 |
| 9.68999999999993e-21 | 0 | 0 | 0.03 | 0 | 0.001 |
| 9.69499999999993e-21 | 0 | 0 | 0.03 | 0 | 0.001 |
| 9.69999999999993e-21 | 0 | 0 | 0.03 | 0 | 0.001 |
| 9.70499999999993e-21 | 0 | 0 | 0.03 | 0 | 0.001 |
| 9.70999999999993e-21 | 0 | 0 | 0.03 | 0 | 0.001 |
| 9.71499999999993e-21 | 0 | 0 | 0.03 | 0 | 0.001 |
| 9.71999999999993e-21 | 0 | 0 | 0.03 | 0 | 0.001 |
| 9.72499999999993e-21 | 0 | 0 | 0.03 | 0 | 0.001 |
| 9.72999999999993e-21 | 0 | 0 | 0.029 | 0 | 0.001 |
| 9.73499999999993e-21 | 0 | 0 | 0.029 | 0 | 0.001 |
| 9.73999999999993e-21 | 0 | 0 | 0.029 | 0 | 0.001 |
| 9.74499999999993e-21 | 0 | 0 | 0.029 | 0 | 0.001 |
| 9.74999999999993e-21 | 0 | 0 | 0.029 | 0 | 0.001 |
| 9.75499999999993e-21 | 0 | 0 | 0.029 | 0 | 0.001 |
| 9.75999999999993e-21 | 0 | 0 | 0.029 | 0 | 0.001 |
| 9.76499999999993e-21 | 0 | 0 | 0.029 | 0 | 0.001 |
| 9.76999999999992e-21 | 0 | 0 | 0.029 | 0 | 0.001 |
| 9.77499999999992e-21 | 0 | 0 | 0.029 | 0 | 0.001 |
| 9.77999999999992e-21 | 0 | 0 | 0.029 | 0 | 0.001 |
| 9.78499999999992e-21 | 0 | 0 | 0.029 | 0 | 0.001 |
| 9.78999999999992e-21 | 0 | 0 | 0.029 | 0 | 0.001 |
| 9.79499999999992e-21 | 0 | 0 | 0.029 | 0 | 0.001 |
| 9.79999999999992e-21 | 0 | 0 | 0.029 | 0 | 0.001 |
| 9.80499999999992e-21 | 0 | 0 | 0.029 | 0 | 0.001 |
| 9.80999999999992e-21 | 0 | 0 | 0.029 | 0 | 0.001 |
| 9.81499999999992e-21 | 0 | 0 | 0.029 | 0 | 0.001 |
| 9.81999999999992e-21 | 0 | 0 | 0.029 | 0 | 0.001 |
| 9.82499999999992e-21 | 0 | 0 | 0.028 | 0 | 0.001 |
| 9.82999999999992e-21 | 0 | 0 | 0.028 | 0 | 0.001 |
| 9.83499999999992e-21 | 0 | 0 | 0.028 | 0 | 0.001 |
| 9.83999999999992e-21 | 0 | 0 | 0.028 | 0 | 0.001 |
| 9.84499999999992e-21 | 0 | 0 | 0.028 | 0 | 0.001 |
| 9.84999999999992e-21 | 0 | 0 | 0.028 | 0 | 0.001 |
| 9.85499999999992e-21 | 0 | 0 | 0.028 | 0 | 0.001 |
| 9.85999999999992e-21 | 0 | 0 | 0.028 | 0 | 0.001 |
| 9.86499999999992e-21 | 0 | 0 | 0.028 | 0 | 0.001 |
| 9.86999999999992e-21 | 0 | 0 | 0.028 | 0 | 0.001 |
| 9.87499999999992e-21 | 0 | 0 | 0.028 | 0 | 0.001 |
| 9.87999999999992e-21 | 0 | 0 | 0.028 | 0 | 0.001 |
| 9.88499999999991e-21 | 0 | 0 | 0.028 | 0 | 0.001 |
| 9.88999999999992e-21 | 0 | 0 | 0.028 | 0 | 0.001 |
| 9.89499999999991e-21 | 0 | 0 | 0.028 | 0 | 0.001 |
| 9.89999999999991e-21 | 0 | 0 | 0.028 | 0 | 0.001 |
| 9.90499999999991e-21 | 0 | 0 | 0.028 | 0 | 0.001 |
| 9.90999999999991e-21 | 0 | 0 | 0.028 | 0 | 0.001 |
| 9.91499999999991e-21 | 0 | 0 | 0.028 | 0 | 0.001 |
| 9.91999999999991e-21 | 0 | 0 | 0.028 | 0 | 0.001 |
| 9.92499999999991e-21 | 0 | 0 | 0.027 | 0 | 0.001 |
| 9.92999999999991e-21 | 0 | 0 | 0.027 | 0 | 0.001 |
| 9.93499999999991e-21 | 0 | 0 | 0.027 | 0 | 0.001 |
| 9.93999999999991e-21 | 0 | 0 | 0.027 | 0 | 0.001 |
| 9.94499999999991e-21 | 0 | 0 | 0.027 | 0 | 0.001 |
| 9.94999999999991e-21 | 0 | 0 | 0.027 | 0 | 0.001 |
| 9.95499999999991e-21 | 0 | 0 | 0.027 | 0 | 0.001 |
| 9.95999999999991e-21 | 0 | 0 | 0.027 | 0 | 0.001 |
| 9.96499999999991e-21 | 0 | 0 | 0.027 | 0 | 0.001 |
| 9.96999999999991e-21 | 0 | 0 | 0.027 | 0 | 0.001 |
| 9.97499999999991e-21 | 0 | 0 | 0.027 | 0 | 0.001 |
| 9.97999999999991e-21 | 0 | 0 | 0.027 | 0 | 0.001 |
| 9.98499999999991e-21 | 0 | 0 | 0.027 | 0 | 0.001 |
| 9.98999999999991e-21 | 0 | 0 | 0.027 | 0 | 0.001 |
| 9.99499999999991e-21 | 0 | 0 | 0.027 | 0 | 0.001 |
| 9.99999999999991e-21 | 0 | 0 | 0.027 | 0 | 0.001 |